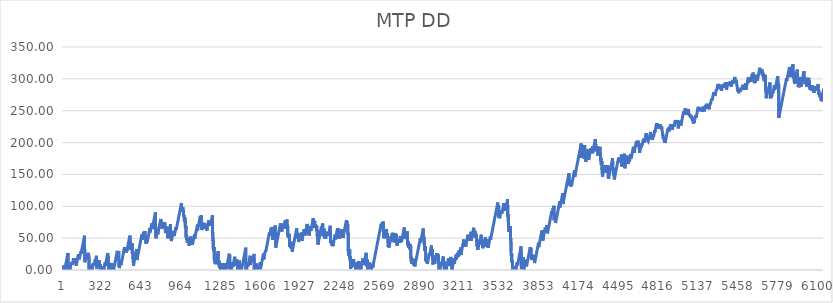
| Category | MTP DD |
|---|---|
| 0 | 1 |
| 1 | 2 |
| 2 | 3 |
| 3 | 4 |
| 4 | 5 |
| 5 | 6 |
| 6 | 7 |
| 7 | 8 |
| 8 | 1.41 |
| 9 | 2.42 |
| 10 | 3.43 |
| 11 | 4.44 |
| 12 | 5.45 |
| 13 | 0 |
| 14 | 1.05 |
| 15 | 2.1 |
| 16 | 3.1 |
| 17 | 4.1 |
| 18 | 5.1 |
| 19 | 6.1 |
| 20 | 7.1 |
| 21 | 8.1 |
| 22 | 9.1 |
| 23 | 10.1 |
| 24 | 11.1 |
| 25 | 12.1 |
| 26 | 13.1 |
| 27 | 14.1 |
| 28 | 15.1 |
| 29 | 16.1 |
| 30 | 17.1 |
| 31 | 18.1 |
| 32 | 19.1 |
| 33 | 20.1 |
| 34 | 21.1 |
| 35 | 22.1 |
| 36 | 23.224 |
| 37 | 24.348 |
| 38 | 25.472 |
| 39 | 26.596 |
| 40 | 0 |
| 41 | 1 |
| 42 | 2 |
| 43 | 3 |
| 44 | 4 |
| 45 | 5 |
| 46 | 6.03 |
| 47 | 0 |
| 48 | 1.03 |
| 49 | 2.06 |
| 50 | 3.117 |
| 51 | 4.175 |
| 52 | 0 |
| 53 | 1.058 |
| 54 | 2.092 |
| 55 | 0 |
| 56 | 1.034 |
| 57 | 2.068 |
| 58 | 3.102 |
| 59 | 4.102 |
| 60 | 5.102 |
| 61 | 6.102 |
| 62 | 7.102 |
| 63 | 8.102 |
| 64 | 9.102 |
| 65 | 10.102 |
| 66 | 11.102 |
| 67 | 12.102 |
| 68 | 13.102 |
| 69 | 8.519 |
| 70 | 9.535 |
| 71 | 10.552 |
| 72 | 11.552 |
| 73 | 12.552 |
| 74 | 13.552 |
| 75 | 8.562 |
| 76 | 9.572 |
| 77 | 10.582 |
| 78 | 11.592 |
| 79 | 12.592 |
| 80 | 13.592 |
| 81 | 14.592 |
| 82 | 15.592 |
| 83 | 16.592 |
| 84 | 17.592 |
| 85 | 18.592 |
| 86 | 19.592 |
| 87 | 12.214 |
| 88 | 13.237 |
| 89 | 14.26 |
| 90 | 15.282 |
| 91 | 10.59 |
| 92 | 11.597 |
| 93 | 12.604 |
| 94 | 13.612 |
| 95 | 14.612 |
| 96 | 15.612 |
| 97 | 16.612 |
| 98 | 17.612 |
| 99 | 18.612 |
| 100 | 13.722 |
| 101 | 14.732 |
| 102 | 15.742 |
| 103 | 16.752 |
| 104 | 17.784 |
| 105 | 18.816 |
| 106 | 6.848 |
| 107 | 7.88 |
| 108 | 8.912 |
| 109 | 9.912 |
| 110 | 10.912 |
| 111 | 11.912 |
| 112 | 12.912 |
| 113 | 13.912 |
| 114 | 14.912 |
| 115 | 15.912 |
| 116 | 16.912 |
| 117 | 17.912 |
| 118 | 18.912 |
| 119 | 19.912 |
| 120 | 20.912 |
| 121 | 21.912 |
| 122 | 22.912 |
| 123 | 23.912 |
| 124 | 24.912 |
| 125 | 19.716 |
| 126 | 20.72 |
| 127 | 21.724 |
| 128 | 22.728 |
| 129 | 23.732 |
| 130 | 24.748 |
| 131 | 16.764 |
| 132 | 17.78 |
| 133 | 18.796 |
| 134 | 19.812 |
| 135 | 20.812 |
| 136 | 21.812 |
| 137 | 22.812 |
| 138 | 23.812 |
| 139 | 24.812 |
| 140 | 25.812 |
| 141 | 26.812 |
| 142 | 27.812 |
| 143 | 28.812 |
| 144 | 29.812 |
| 145 | 25.429 |
| 146 | 26.445 |
| 147 | 27.462 |
| 148 | 28.462 |
| 149 | 29.462 |
| 150 | 30.462 |
| 151 | 31.462 |
| 152 | 32.462 |
| 153 | 33.462 |
| 154 | 34.462 |
| 155 | 35.462 |
| 156 | 36.462 |
| 157 | 37.462 |
| 158 | 38.462 |
| 159 | 39.462 |
| 160 | 40.462 |
| 161 | 41.462 |
| 162 | 42.462 |
| 163 | 43.462 |
| 164 | 44.462 |
| 165 | 45.462 |
| 166 | 46.462 |
| 167 | 47.462 |
| 168 | 48.462 |
| 169 | 49.462 |
| 170 | 50.462 |
| 171 | 51.462 |
| 172 | 52.662 |
| 173 | 53.862 |
| 174 | 55.062 |
| 175 | 12.262 |
| 176 | 13.262 |
| 177 | 14.262 |
| 178 | 15.262 |
| 179 | 16.262 |
| 180 | 17.262 |
| 181 | 18.262 |
| 182 | 19.262 |
| 183 | 20.262 |
| 184 | 21.262 |
| 185 | 22.262 |
| 186 | 23.262 |
| 187 | 24.262 |
| 188 | 16.876 |
| 189 | 17.89 |
| 190 | 18.904 |
| 191 | 19.918 |
| 192 | 20.932 |
| 193 | 21.932 |
| 194 | 22.932 |
| 195 | 23.932 |
| 196 | 24.932 |
| 197 | 20.932 |
| 198 | 21.932 |
| 199 | 22.932 |
| 200 | 23.932 |
| 201 | 24.932 |
| 202 | 25.932 |
| 203 | 26.932 |
| 204 | 18.772 |
| 205 | 19.812 |
| 206 | 20.852 |
| 207 | 21.957 |
| 208 | 23.062 |
| 209 | 24.167 |
| 210 | 0.272 |
| 211 | 1.287 |
| 212 | 0 |
| 213 | 1.015 |
| 214 | 2.03 |
| 215 | 3.03 |
| 216 | 4.03 |
| 217 | 5.03 |
| 218 | 6.03 |
| 219 | 7.03 |
| 220 | 8.03 |
| 221 | 9.12 |
| 222 | 0 |
| 223 | 1.034 |
| 224 | 0 |
| 225 | 1.034 |
| 226 | 2.068 |
| 227 | 3.102 |
| 228 | 0 |
| 229 | 1.02 |
| 230 | 2.04 |
| 231 | 3.06 |
| 232 | 4.075 |
| 233 | 0 |
| 234 | 1.015 |
| 235 | 2.03 |
| 236 | 3.03 |
| 237 | 4.03 |
| 238 | 5.03 |
| 239 | 6.03 |
| 240 | 7.03 |
| 241 | 8.03 |
| 242 | 9.03 |
| 243 | 10.03 |
| 244 | 7.1 |
| 245 | 8.12 |
| 246 | 9.12 |
| 247 | 10.12 |
| 248 | 11.12 |
| 249 | 12.12 |
| 250 | 6.726 |
| 251 | 7.732 |
| 252 | 8.738 |
| 253 | 9.744 |
| 254 | 10.75 |
| 255 | 11.75 |
| 256 | 12.75 |
| 257 | 13.75 |
| 258 | 14.75 |
| 259 | 15.75 |
| 260 | 16.75 |
| 261 | 14.103 |
| 262 | 15.107 |
| 263 | 16.11 |
| 264 | 17.11 |
| 265 | 18.11 |
| 266 | 19.11 |
| 267 | 20.11 |
| 268 | 21.11 |
| 269 | 22.2 |
| 270 | 23.29 |
| 271 | 2.38 |
| 272 | 3.47 |
| 273 | 4.47 |
| 274 | 5.47 |
| 275 | 6.47 |
| 276 | 7.47 |
| 277 | 8.47 |
| 278 | 9.47 |
| 279 | 10.47 |
| 280 | 11.47 |
| 281 | 12.47 |
| 282 | 13.47 |
| 283 | 14.492 |
| 284 | 5.014 |
| 285 | 6.036 |
| 286 | 7.058 |
| 287 | 8.08 |
| 288 | 9.08 |
| 289 | 10.08 |
| 290 | 11.08 |
| 291 | 12.08 |
| 292 | 13.08 |
| 293 | 14.104 |
| 294 | 15.128 |
| 295 | 5.152 |
| 296 | 6.176 |
| 297 | 7.2 |
| 298 | 8.28 |
| 299 | 9.36 |
| 300 | 10.44 |
| 301 | 0 |
| 302 | 1.08 |
| 303 | 2.08 |
| 304 | 3.08 |
| 305 | 0 |
| 306 | 1.012 |
| 307 | 2.024 |
| 308 | 3.036 |
| 309 | 4.048 |
| 310 | 5.228 |
| 311 | 6.408 |
| 312 | 0 |
| 313 | 0 |
| 314 | 1.008 |
| 315 | 2.016 |
| 316 | 3.024 |
| 317 | 4.032 |
| 318 | 0 |
| 319 | 1.015 |
| 320 | 2.03 |
| 321 | 3.045 |
| 322 | 4.205 |
| 323 | 0 |
| 324 | 1.16 |
| 325 | 2.245 |
| 326 | 3.33 |
| 327 | 4.415 |
| 328 | 0 |
| 329 | 1 |
| 330 | 2 |
| 331 | 3 |
| 332 | 4 |
| 333 | 5 |
| 334 | 6 |
| 335 | 7 |
| 336 | 8 |
| 337 | 9 |
| 338 | 10 |
| 339 | 11 |
| 340 | 12 |
| 341 | 6.623 |
| 342 | 7.647 |
| 343 | 8.67 |
| 344 | 9.67 |
| 345 | 10.67 |
| 346 | 11.67 |
| 347 | 12.67 |
| 348 | 13.67 |
| 349 | 14.67 |
| 350 | 15.67 |
| 351 | 16.67 |
| 352 | 17.67 |
| 353 | 18.67 |
| 354 | 19.67 |
| 355 | 20.67 |
| 356 | 21.67 |
| 357 | 22.67 |
| 358 | 23.67 |
| 359 | 24.67 |
| 360 | 25.67 |
| 361 | 26.67 |
| 362 | 17.717 |
| 363 | 18.763 |
| 364 | 19.81 |
| 365 | 20.99 |
| 366 | 22.17 |
| 367 | 23.35 |
| 368 | 0 |
| 369 | 1.042 |
| 370 | 2.084 |
| 371 | 3.126 |
| 372 | 0 |
| 373 | 1.042 |
| 374 | 2.054 |
| 375 | 0 |
| 376 | 1.012 |
| 377 | 2.024 |
| 378 | 3.036 |
| 379 | 4.036 |
| 380 | 5.036 |
| 381 | 6.036 |
| 382 | 7.036 |
| 383 | 8.04 |
| 384 | 3.044 |
| 385 | 4.048 |
| 386 | 5.052 |
| 387 | 6.056 |
| 388 | 7.056 |
| 389 | 8.056 |
| 390 | 9.056 |
| 391 | 10.056 |
| 392 | 11.056 |
| 393 | 12.126 |
| 394 | 3.996 |
| 395 | 4.996 |
| 396 | 5.996 |
| 397 | 6.996 |
| 398 | 7.996 |
| 399 | 9.022 |
| 400 | 0 |
| 401 | 1.026 |
| 402 | 2.052 |
| 403 | 3.078 |
| 404 | 4.146 |
| 405 | 5.213 |
| 406 | 0 |
| 407 | 1.067 |
| 408 | 0 |
| 409 | 1.013 |
| 410 | 2.027 |
| 411 | 3.027 |
| 412 | 4.027 |
| 413 | 5.027 |
| 414 | 6.027 |
| 415 | 7.027 |
| 416 | 8.027 |
| 417 | 9.027 |
| 418 | 10.027 |
| 419 | 11.027 |
| 420 | 12.027 |
| 421 | 13.027 |
| 422 | 14.027 |
| 423 | 15.027 |
| 424 | 16.027 |
| 425 | 17.027 |
| 426 | 18.027 |
| 427 | 19.027 |
| 428 | 20.027 |
| 429 | 21.027 |
| 430 | 22.027 |
| 431 | 23.027 |
| 432 | 24.027 |
| 433 | 25.027 |
| 434 | 26.027 |
| 435 | 27.027 |
| 436 | 28.027 |
| 437 | 29.027 |
| 438 | 30.027 |
| 439 | 19.055 |
| 440 | 20.083 |
| 441 | 21.111 |
| 442 | 22.139 |
| 443 | 23.167 |
| 444 | 24.167 |
| 445 | 25.167 |
| 446 | 26.167 |
| 447 | 27.251 |
| 448 | 28.335 |
| 449 | 29.419 |
| 450 | 30.503 |
| 451 | 5.587 |
| 452 | 6.587 |
| 453 | 7.587 |
| 454 | 8.587 |
| 455 | 2.999 |
| 456 | 4.012 |
| 457 | 5.024 |
| 458 | 6.037 |
| 459 | 7.037 |
| 460 | 8.037 |
| 461 | 9.037 |
| 462 | 10.037 |
| 463 | 11.037 |
| 464 | 12.037 |
| 465 | 13.037 |
| 466 | 14.037 |
| 467 | 15.097 |
| 468 | 7.957 |
| 469 | 8.957 |
| 470 | 9.957 |
| 471 | 10.957 |
| 472 | 11.957 |
| 473 | 12.957 |
| 474 | 13.957 |
| 475 | 14.957 |
| 476 | 15.957 |
| 477 | 16.957 |
| 478 | 17.957 |
| 479 | 18.957 |
| 480 | 19.957 |
| 481 | 20.957 |
| 482 | 21.957 |
| 483 | 22.957 |
| 484 | 23.957 |
| 485 | 24.957 |
| 486 | 25.957 |
| 487 | 26.957 |
| 488 | 27.957 |
| 489 | 28.957 |
| 490 | 29.957 |
| 491 | 30.957 |
| 492 | 31.957 |
| 493 | 32.957 |
| 494 | 33.957 |
| 495 | 34.957 |
| 496 | 35.977 |
| 497 | 26.997 |
| 498 | 28.017 |
| 499 | 29.037 |
| 500 | 30.057 |
| 501 | 31.057 |
| 502 | 32.057 |
| 503 | 33.057 |
| 504 | 34.057 |
| 505 | 35.057 |
| 506 | 36.057 |
| 507 | 27.087 |
| 508 | 28.117 |
| 509 | 29.147 |
| 510 | 30.177 |
| 511 | 31.177 |
| 512 | 32.177 |
| 513 | 33.177 |
| 514 | 34.184 |
| 515 | 29.892 |
| 516 | 30.899 |
| 517 | 31.907 |
| 518 | 32.907 |
| 519 | 33.907 |
| 520 | 34.907 |
| 521 | 35.907 |
| 522 | 36.907 |
| 523 | 37.907 |
| 524 | 38.907 |
| 525 | 39.907 |
| 526 | 40.907 |
| 527 | 41.907 |
| 528 | 42.907 |
| 529 | 43.907 |
| 530 | 44.907 |
| 531 | 45.907 |
| 532 | 46.907 |
| 533 | 47.907 |
| 534 | 48.907 |
| 535 | 49.907 |
| 536 | 50.907 |
| 537 | 51.907 |
| 538 | 52.907 |
| 539 | 53.952 |
| 540 | 54.997 |
| 541 | 43.042 |
| 542 | 44.087 |
| 543 | 45.163 |
| 544 | 31.74 |
| 545 | 32.817 |
| 546 | 33.817 |
| 547 | 34.817 |
| 548 | 35.817 |
| 549 | 36.817 |
| 550 | 37.817 |
| 551 | 38.817 |
| 552 | 35.817 |
| 553 | 36.817 |
| 554 | 37.817 |
| 555 | 38.817 |
| 556 | 39.817 |
| 557 | 40.867 |
| 558 | 41.917 |
| 559 | 25.467 |
| 560 | 26.517 |
| 561 | 27.567 |
| 562 | 28.597 |
| 563 | 29.627 |
| 564 | 18.157 |
| 565 | 19.187 |
| 566 | 20.217 |
| 567 | 21.259 |
| 568 | 6.801 |
| 569 | 7.843 |
| 570 | 8.885 |
| 571 | 9.927 |
| 572 | 10.927 |
| 573 | 11.927 |
| 574 | 12.927 |
| 575 | 13.927 |
| 576 | 14.927 |
| 577 | 15.927 |
| 578 | 16.927 |
| 579 | 17.927 |
| 580 | 18.927 |
| 581 | 19.927 |
| 582 | 20.927 |
| 583 | 21.927 |
| 584 | 22.927 |
| 585 | 23.927 |
| 586 | 24.927 |
| 587 | 25.927 |
| 588 | 26.927 |
| 589 | 27.927 |
| 590 | 28.927 |
| 591 | 29.927 |
| 592 | 30.927 |
| 593 | 31.927 |
| 594 | 33.004 |
| 595 | 34.082 |
| 596 | 15.659 |
| 597 | 16.737 |
| 598 | 17.737 |
| 599 | 18.737 |
| 600 | 19.737 |
| 601 | 20.737 |
| 602 | 21.737 |
| 603 | 22.737 |
| 604 | 23.737 |
| 605 | 24.737 |
| 606 | 25.737 |
| 607 | 26.737 |
| 608 | 27.737 |
| 609 | 28.737 |
| 610 | 29.737 |
| 611 | 30.737 |
| 612 | 31.737 |
| 613 | 32.737 |
| 614 | 33.737 |
| 615 | 34.737 |
| 616 | 35.737 |
| 617 | 36.737 |
| 618 | 37.737 |
| 619 | 38.737 |
| 620 | 39.737 |
| 621 | 40.737 |
| 622 | 41.737 |
| 623 | 42.737 |
| 624 | 43.737 |
| 625 | 44.737 |
| 626 | 45.737 |
| 627 | 46.737 |
| 628 | 47.737 |
| 629 | 48.737 |
| 630 | 49.737 |
| 631 | 50.737 |
| 632 | 51.737 |
| 633 | 52.737 |
| 634 | 53.737 |
| 635 | 54.737 |
| 636 | 55.737 |
| 637 | 56.767 |
| 638 | 47.797 |
| 639 | 48.827 |
| 640 | 49.857 |
| 641 | 50.857 |
| 642 | 51.857 |
| 643 | 52.857 |
| 644 | 53.857 |
| 645 | 54.857 |
| 646 | 55.857 |
| 647 | 56.857 |
| 648 | 57.857 |
| 649 | 58.857 |
| 650 | 59.882 |
| 651 | 60.907 |
| 652 | 53.132 |
| 653 | 54.157 |
| 654 | 55.157 |
| 655 | 56.157 |
| 656 | 57.157 |
| 657 | 58.157 |
| 658 | 59.157 |
| 659 | 60.179 |
| 660 | 61.201 |
| 661 | 51.723 |
| 662 | 52.745 |
| 663 | 53.767 |
| 664 | 51.132 |
| 665 | 52.147 |
| 666 | 53.177 |
| 667 | 44.207 |
| 668 | 45.237 |
| 669 | 46.267 |
| 670 | 41.277 |
| 671 | 42.287 |
| 672 | 43.297 |
| 673 | 44.307 |
| 674 | 45.307 |
| 675 | 46.307 |
| 676 | 47.307 |
| 677 | 48.307 |
| 678 | 49.307 |
| 679 | 43.919 |
| 680 | 44.932 |
| 681 | 45.944 |
| 682 | 46.957 |
| 683 | 47.957 |
| 684 | 48.957 |
| 685 | 49.957 |
| 686 | 50.957 |
| 687 | 51.957 |
| 688 | 52.957 |
| 689 | 53.957 |
| 690 | 54.957 |
| 691 | 55.957 |
| 692 | 56.957 |
| 693 | 57.957 |
| 694 | 58.957 |
| 695 | 59.957 |
| 696 | 60.957 |
| 697 | 61.957 |
| 698 | 62.957 |
| 699 | 63.957 |
| 700 | 64.957 |
| 701 | 65.957 |
| 702 | 66.997 |
| 703 | 59.237 |
| 704 | 60.277 |
| 705 | 61.277 |
| 706 | 62.277 |
| 707 | 63.277 |
| 708 | 64.277 |
| 709 | 65.277 |
| 710 | 66.277 |
| 711 | 67.277 |
| 712 | 68.277 |
| 713 | 69.277 |
| 714 | 70.277 |
| 715 | 71.277 |
| 716 | 72.277 |
| 717 | 73.301 |
| 718 | 74.325 |
| 719 | 64.349 |
| 720 | 65.373 |
| 721 | 66.397 |
| 722 | 67.397 |
| 723 | 68.397 |
| 724 | 69.397 |
| 725 | 70.397 |
| 726 | 71.397 |
| 727 | 72.397 |
| 728 | 73.397 |
| 729 | 74.397 |
| 730 | 75.397 |
| 731 | 76.397 |
| 732 | 77.397 |
| 733 | 78.397 |
| 734 | 79.397 |
| 735 | 80.397 |
| 736 | 81.397 |
| 737 | 82.397 |
| 738 | 83.397 |
| 739 | 84.397 |
| 740 | 85.397 |
| 741 | 86.397 |
| 742 | 87.397 |
| 743 | 88.397 |
| 744 | 89.397 |
| 745 | 90.647 |
| 746 | 64.897 |
| 747 | 66 |
| 748 | 67.103 |
| 749 | 49.707 |
| 750 | 50.707 |
| 751 | 51.707 |
| 752 | 52.707 |
| 753 | 53.707 |
| 754 | 54.707 |
| 755 | 55.707 |
| 756 | 56.707 |
| 757 | 57.707 |
| 758 | 58.707 |
| 759 | 59.707 |
| 760 | 60.707 |
| 761 | 61.707 |
| 762 | 62.707 |
| 763 | 63.721 |
| 764 | 56.135 |
| 765 | 57.149 |
| 766 | 58.163 |
| 767 | 59.177 |
| 768 | 60.177 |
| 769 | 61.177 |
| 770 | 62.177 |
| 771 | 63.177 |
| 772 | 64.177 |
| 773 | 65.177 |
| 774 | 66.177 |
| 775 | 67.177 |
| 776 | 68.177 |
| 777 | 69.177 |
| 778 | 70.177 |
| 779 | 71.177 |
| 780 | 72.177 |
| 781 | 73.177 |
| 782 | 74.177 |
| 783 | 75.177 |
| 784 | 76.177 |
| 785 | 77.177 |
| 786 | 78.177 |
| 787 | 79.177 |
| 788 | 80.177 |
| 789 | 81.177 |
| 790 | 72.993 |
| 791 | 74.009 |
| 792 | 75.025 |
| 793 | 76.041 |
| 794 | 77.057 |
| 795 | 78.093 |
| 796 | 65.129 |
| 797 | 66.165 |
| 798 | 67.201 |
| 799 | 68.237 |
| 800 | 69.237 |
| 801 | 70.237 |
| 802 | 71.237 |
| 803 | 72.237 |
| 804 | 73.237 |
| 805 | 74.253 |
| 806 | 75.269 |
| 807 | 67.085 |
| 808 | 68.101 |
| 809 | 69.117 |
| 810 | 70.117 |
| 811 | 71.117 |
| 812 | 72.117 |
| 813 | 73.117 |
| 814 | 74.117 |
| 815 | 75.117 |
| 816 | 76.117 |
| 817 | 70.523 |
| 818 | 71.529 |
| 819 | 72.535 |
| 820 | 73.541 |
| 821 | 74.547 |
| 822 | 65.793 |
| 823 | 66.84 |
| 824 | 67.887 |
| 825 | 61.103 |
| 826 | 62.119 |
| 827 | 63.135 |
| 828 | 64.151 |
| 829 | 57.959 |
| 830 | 58.967 |
| 831 | 59.975 |
| 832 | 60.983 |
| 833 | 61.991 |
| 834 | 62.991 |
| 835 | 63.991 |
| 836 | 64.991 |
| 837 | 65.991 |
| 838 | 67.021 |
| 839 | 68.051 |
| 840 | 69.081 |
| 841 | 57.611 |
| 842 | 58.641 |
| 843 | 59.669 |
| 844 | 60.697 |
| 845 | 49.725 |
| 846 | 50.753 |
| 847 | 51.781 |
| 848 | 52.781 |
| 849 | 53.781 |
| 850 | 54.781 |
| 851 | 55.781 |
| 852 | 56.781 |
| 853 | 57.781 |
| 854 | 58.781 |
| 855 | 59.781 |
| 856 | 60.781 |
| 857 | 61.781 |
| 858 | 62.781 |
| 859 | 63.781 |
| 860 | 64.781 |
| 861 | 65.781 |
| 862 | 66.781 |
| 863 | 67.781 |
| 864 | 68.827 |
| 865 | 69.873 |
| 866 | 70.919 |
| 867 | 71.965 |
| 868 | 56.511 |
| 869 | 57.526 |
| 870 | 51.341 |
| 871 | 52.356 |
| 872 | 53.371 |
| 873 | 54.391 |
| 874 | 45.411 |
| 875 | 46.431 |
| 876 | 47.451 |
| 877 | 48.471 |
| 878 | 49.471 |
| 879 | 50.471 |
| 880 | 51.471 |
| 881 | 52.471 |
| 882 | 53.471 |
| 883 | 54.471 |
| 884 | 55.471 |
| 885 | 56.471 |
| 886 | 57.471 |
| 887 | 58.471 |
| 888 | 59.471 |
| 889 | 60.471 |
| 890 | 61.471 |
| 891 | 62.471 |
| 892 | 53.491 |
| 893 | 54.511 |
| 894 | 55.531 |
| 895 | 56.551 |
| 896 | 57.571 |
| 897 | 53.376 |
| 898 | 54.381 |
| 899 | 55.386 |
| 900 | 56.391 |
| 901 | 57.391 |
| 902 | 58.391 |
| 903 | 59.391 |
| 904 | 60.391 |
| 905 | 61.391 |
| 906 | 62.391 |
| 907 | 63.391 |
| 908 | 64.391 |
| 909 | 65.391 |
| 910 | 66.391 |
| 911 | 67.391 |
| 912 | 68.391 |
| 913 | 63.201 |
| 914 | 64.211 |
| 915 | 65.221 |
| 916 | 66.231 |
| 917 | 67.231 |
| 918 | 68.231 |
| 919 | 69.231 |
| 920 | 70.231 |
| 921 | 71.231 |
| 922 | 72.231 |
| 923 | 73.231 |
| 924 | 74.231 |
| 925 | 75.231 |
| 926 | 76.231 |
| 927 | 77.231 |
| 928 | 78.231 |
| 929 | 79.231 |
| 930 | 80.231 |
| 931 | 81.231 |
| 932 | 82.231 |
| 933 | 83.231 |
| 934 | 84.231 |
| 935 | 85.231 |
| 936 | 86.231 |
| 937 | 87.231 |
| 938 | 88.231 |
| 939 | 89.231 |
| 940 | 90.231 |
| 941 | 91.231 |
| 942 | 92.231 |
| 943 | 93.231 |
| 944 | 94.231 |
| 945 | 95.231 |
| 946 | 96.231 |
| 947 | 97.231 |
| 948 | 98.231 |
| 949 | 99.231 |
| 950 | 100.231 |
| 951 | 101.231 |
| 952 | 102.231 |
| 953 | 103.231 |
| 954 | 104.231 |
| 955 | 105.273 |
| 956 | 91.815 |
| 957 | 92.857 |
| 958 | 93.899 |
| 959 | 94.899 |
| 960 | 95.899 |
| 961 | 96.899 |
| 962 | 97.899 |
| 963 | 94.199 |
| 964 | 95.199 |
| 965 | 96.199 |
| 966 | 97.199 |
| 967 | 98.199 |
| 968 | 99.215 |
| 969 | 91.431 |
| 970 | 92.447 |
| 971 | 93.463 |
| 972 | 94.479 |
| 973 | 84.035 |
| 974 | 85.092 |
| 975 | 86.149 |
| 976 | 87.199 |
| 977 | 81.449 |
| 978 | 76.061 |
| 979 | 77.074 |
| 980 | 78.086 |
| 981 | 79.099 |
| 982 | 80.135 |
| 983 | 81.171 |
| 984 | 82.207 |
| 985 | 83.243 |
| 986 | 70.279 |
| 987 | 65.383 |
| 988 | 66.387 |
| 989 | 67.391 |
| 990 | 68.395 |
| 991 | 69.399 |
| 992 | 70.471 |
| 993 | 50.543 |
| 994 | 51.615 |
| 995 | 52.615 |
| 996 | 53.615 |
| 997 | 54.615 |
| 998 | 47.237 |
| 999 | 48.26 |
| 1000 | 49.282 |
| 1001 | 50.305 |
| 1002 | 43.317 |
| 1003 | 44.329 |
| 1004 | 45.341 |
| 1005 | 46.353 |
| 1006 | 47.365 |
| 1007 | 48.365 |
| 1008 | 49.365 |
| 1009 | 50.365 |
| 1010 | 45.369 |
| 1011 | 46.373 |
| 1012 | 47.377 |
| 1013 | 48.381 |
| 1014 | 49.385 |
| 1015 | 50.417 |
| 1016 | 38.449 |
| 1017 | 39.481 |
| 1018 | 40.513 |
| 1019 | 41.545 |
| 1020 | 42.545 |
| 1021 | 43.545 |
| 1022 | 44.545 |
| 1023 | 45.545 |
| 1024 | 46.545 |
| 1025 | 47.545 |
| 1026 | 48.545 |
| 1027 | 49.545 |
| 1028 | 50.545 |
| 1029 | 51.577 |
| 1030 | 52.609 |
| 1031 | 40.641 |
| 1032 | 41.673 |
| 1033 | 42.705 |
| 1034 | 43.705 |
| 1035 | 44.705 |
| 1036 | 45.705 |
| 1037 | 46.705 |
| 1038 | 47.705 |
| 1039 | 42.311 |
| 1040 | 43.317 |
| 1041 | 44.323 |
| 1042 | 45.329 |
| 1043 | 46.335 |
| 1044 | 39.745 |
| 1045 | 40.755 |
| 1046 | 41.765 |
| 1047 | 42.775 |
| 1048 | 43.785 |
| 1049 | 44.785 |
| 1050 | 45.785 |
| 1051 | 46.785 |
| 1052 | 47.785 |
| 1053 | 48.785 |
| 1054 | 49.785 |
| 1055 | 50.785 |
| 1056 | 51.785 |
| 1057 | 52.785 |
| 1058 | 53.785 |
| 1059 | 54.785 |
| 1060 | 55.785 |
| 1061 | 56.801 |
| 1062 | 49.017 |
| 1063 | 50.033 |
| 1064 | 51.049 |
| 1065 | 52.065 |
| 1066 | 53.065 |
| 1067 | 54.065 |
| 1068 | 55.065 |
| 1069 | 56.065 |
| 1070 | 57.065 |
| 1071 | 58.065 |
| 1072 | 59.065 |
| 1073 | 60.065 |
| 1074 | 61.065 |
| 1075 | 62.065 |
| 1076 | 63.065 |
| 1077 | 64.065 |
| 1078 | 65.065 |
| 1079 | 66.065 |
| 1080 | 67.065 |
| 1081 | 68.065 |
| 1082 | 69.065 |
| 1083 | 70.065 |
| 1084 | 71.065 |
| 1085 | 62.085 |
| 1086 | 63.105 |
| 1087 | 64.125 |
| 1088 | 65.145 |
| 1089 | 66.165 |
| 1090 | 67.165 |
| 1091 | 68.165 |
| 1092 | 69.165 |
| 1093 | 70.165 |
| 1094 | 71.165 |
| 1095 | 72.165 |
| 1096 | 73.165 |
| 1097 | 74.165 |
| 1098 | 75.165 |
| 1099 | 76.165 |
| 1100 | 77.165 |
| 1101 | 78.165 |
| 1102 | 79.165 |
| 1103 | 80.165 |
| 1104 | 81.165 |
| 1105 | 82.165 |
| 1106 | 83.165 |
| 1107 | 84.165 |
| 1108 | 85.165 |
| 1109 | 79.777 |
| 1110 | 80.79 |
| 1111 | 81.802 |
| 1112 | 82.815 |
| 1113 | 83.815 |
| 1114 | 84.815 |
| 1115 | 85.882 |
| 1116 | 69.45 |
| 1117 | 70.517 |
| 1118 | 71.585 |
| 1119 | 62.631 |
| 1120 | 63.678 |
| 1121 | 64.725 |
| 1122 | 65.725 |
| 1123 | 66.725 |
| 1124 | 67.725 |
| 1125 | 68.725 |
| 1126 | 69.725 |
| 1127 | 70.725 |
| 1128 | 71.725 |
| 1129 | 66.137 |
| 1130 | 67.15 |
| 1131 | 68.162 |
| 1132 | 69.175 |
| 1133 | 70.175 |
| 1134 | 71.175 |
| 1135 | 72.175 |
| 1136 | 73.175 |
| 1137 | 74.175 |
| 1138 | 75.205 |
| 1139 | 64.735 |
| 1140 | 65.765 |
| 1141 | 66.795 |
| 1142 | 67.795 |
| 1143 | 68.795 |
| 1144 | 69.795 |
| 1145 | 70.795 |
| 1146 | 71.795 |
| 1147 | 72.828 |
| 1148 | 66.061 |
| 1149 | 67.095 |
| 1150 | 68.095 |
| 1151 | 69.095 |
| 1152 | 70.095 |
| 1153 | 71.095 |
| 1154 | 72.095 |
| 1155 | 73.109 |
| 1156 | 65.523 |
| 1157 | 66.537 |
| 1158 | 67.551 |
| 1159 | 68.565 |
| 1160 | 62.02 |
| 1161 | 63.075 |
| 1162 | 64.075 |
| 1163 | 65.075 |
| 1164 | 66.075 |
| 1165 | 67.075 |
| 1166 | 68.075 |
| 1167 | 69.075 |
| 1168 | 70.075 |
| 1169 | 71.075 |
| 1170 | 72.075 |
| 1171 | 73.075 |
| 1172 | 74.075 |
| 1173 | 75.075 |
| 1174 | 76.075 |
| 1175 | 77.075 |
| 1176 | 78.075 |
| 1177 | 79.097 |
| 1178 | 69.619 |
| 1179 | 70.641 |
| 1180 | 71.663 |
| 1181 | 72.685 |
| 1182 | 73.685 |
| 1183 | 74.685 |
| 1184 | 75.685 |
| 1185 | 70.489 |
| 1186 | 71.493 |
| 1187 | 72.497 |
| 1188 | 73.501 |
| 1189 | 74.505 |
| 1190 | 75.505 |
| 1191 | 76.505 |
| 1192 | 77.505 |
| 1193 | 73.71 |
| 1194 | 74.715 |
| 1195 | 75.72 |
| 1196 | 76.725 |
| 1197 | 77.725 |
| 1198 | 78.725 |
| 1199 | 79.725 |
| 1200 | 80.725 |
| 1201 | 81.725 |
| 1202 | 82.825 |
| 1203 | 83.925 |
| 1204 | 85.025 |
| 1205 | 86.125 |
| 1206 | 57.225 |
| 1207 | 58.265 |
| 1208 | 59.305 |
| 1209 | 45.345 |
| 1210 | 46.385 |
| 1211 | 47.425 |
| 1212 | 48.505 |
| 1213 | 29.585 |
| 1214 | 30.665 |
| 1215 | 31.745 |
| 1216 | 32.803 |
| 1217 | 33.861 |
| 1218 | 34.919 |
| 1219 | 35.977 |
| 1220 | 17.535 |
| 1221 | 18.543 |
| 1222 | 12.551 |
| 1223 | 13.559 |
| 1224 | 14.567 |
| 1225 | 15.575 |
| 1226 | 10.379 |
| 1227 | 11.383 |
| 1228 | 12.387 |
| 1229 | 13.391 |
| 1230 | 14.395 |
| 1231 | 9.199 |
| 1232 | 10.203 |
| 1233 | 11.207 |
| 1234 | 12.211 |
| 1235 | 13.215 |
| 1236 | 14.215 |
| 1237 | 15.215 |
| 1238 | 16.215 |
| 1239 | 17.215 |
| 1240 | 18.215 |
| 1241 | 19.215 |
| 1242 | 20.215 |
| 1243 | 21.215 |
| 1244 | 22.215 |
| 1245 | 23.215 |
| 1246 | 24.215 |
| 1247 | 25.215 |
| 1248 | 26.215 |
| 1249 | 27.287 |
| 1250 | 28.359 |
| 1251 | 29.431 |
| 1252 | 30.503 |
| 1253 | 8.575 |
| 1254 | 9.575 |
| 1255 | 10.575 |
| 1256 | 11.575 |
| 1257 | 12.575 |
| 1258 | 13.575 |
| 1259 | 14.603 |
| 1260 | 15.631 |
| 1261 | 4.659 |
| 1262 | 5.687 |
| 1263 | 6.715 |
| 1264 | 2.815 |
| 1265 | 3.815 |
| 1266 | 4.815 |
| 1267 | 5.815 |
| 1268 | 6.815 |
| 1269 | 7.851 |
| 1270 | 0 |
| 1271 | 1.036 |
| 1272 | 2.072 |
| 1273 | 3.108 |
| 1274 | 4.108 |
| 1275 | 5.108 |
| 1276 | 6.108 |
| 1277 | 7.108 |
| 1278 | 8.108 |
| 1279 | 9.298 |
| 1280 | 10.488 |
| 1281 | 11.678 |
| 1282 | 0 |
| 1283 | 1.125 |
| 1284 | 2.25 |
| 1285 | 0 |
| 1286 | 1.125 |
| 1287 | 2.125 |
| 1288 | 3.125 |
| 1289 | 4.125 |
| 1290 | 5.125 |
| 1291 | 6.125 |
| 1292 | 7.181 |
| 1293 | 8.237 |
| 1294 | 9.293 |
| 1295 | 0 |
| 1296 | 1.056 |
| 1297 | 2.056 |
| 1298 | 3.056 |
| 1299 | 4.056 |
| 1300 | 5.056 |
| 1301 | 6.056 |
| 1302 | 7.156 |
| 1303 | 8.256 |
| 1304 | 9.356 |
| 1305 | 10.456 |
| 1306 | 0 |
| 1307 | 1 |
| 1308 | 2 |
| 1309 | 3 |
| 1310 | 4 |
| 1311 | 5 |
| 1312 | 6 |
| 1313 | 7 |
| 1314 | 8 |
| 1315 | 9.027 |
| 1316 | 10.055 |
| 1317 | 1.482 |
| 1318 | 2.51 |
| 1319 | 3.51 |
| 1320 | 4.51 |
| 1321 | 5.51 |
| 1322 | 6.51 |
| 1323 | 7.51 |
| 1324 | 8.51 |
| 1325 | 9.51 |
| 1326 | 10.51 |
| 1327 | 11.51 |
| 1328 | 12.51 |
| 1329 | 13.51 |
| 1330 | 14.51 |
| 1331 | 15.51 |
| 1332 | 16.51 |
| 1333 | 17.51 |
| 1334 | 18.51 |
| 1335 | 19.51 |
| 1336 | 20.51 |
| 1337 | 21.51 |
| 1338 | 22.51 |
| 1339 | 23.51 |
| 1340 | 24.51 |
| 1341 | 25.51 |
| 1342 | 21.92 |
| 1343 | 22.93 |
| 1344 | 23.94 |
| 1345 | 25.17 |
| 1346 | 1.4 |
| 1347 | 2.436 |
| 1348 | 3.472 |
| 1349 | 0 |
| 1350 | 1.036 |
| 1351 | 2.072 |
| 1352 | 3.122 |
| 1353 | 4.172 |
| 1354 | 0 |
| 1355 | 1.05 |
| 1356 | 0 |
| 1357 | 1 |
| 1358 | 2 |
| 1359 | 3 |
| 1360 | 4 |
| 1361 | 5 |
| 1362 | 6 |
| 1363 | 7 |
| 1364 | 8 |
| 1365 | 9 |
| 1366 | 10 |
| 1367 | 11 |
| 1368 | 12.014 |
| 1369 | 4.628 |
| 1370 | 5.642 |
| 1371 | 6.656 |
| 1372 | 7.67 |
| 1373 | 8.67 |
| 1374 | 9.67 |
| 1375 | 10.67 |
| 1376 | 11.67 |
| 1377 | 12.67 |
| 1378 | 13.67 |
| 1379 | 14.67 |
| 1380 | 15.67 |
| 1381 | 16.67 |
| 1382 | 17.67 |
| 1383 | 18.71 |
| 1384 | 19.75 |
| 1385 | 20.79 |
| 1386 | 6.83 |
| 1387 | 7.87 |
| 1388 | 8.87 |
| 1389 | 9.87 |
| 1390 | 10.87 |
| 1391 | 11.87 |
| 1392 | 12.87 |
| 1393 | 13.87 |
| 1394 | 14.87 |
| 1395 | 15.87 |
| 1396 | 16.87 |
| 1397 | 13.777 |
| 1398 | 14.783 |
| 1399 | 15.79 |
| 1400 | 9.998 |
| 1401 | 11.006 |
| 1402 | 12.014 |
| 1403 | 13.022 |
| 1404 | 14.03 |
| 1405 | 15.074 |
| 1406 | 16.118 |
| 1407 | 1.162 |
| 1408 | 2.206 |
| 1409 | 3.25 |
| 1410 | 0.307 |
| 1411 | 1.313 |
| 1412 | 2.32 |
| 1413 | 3.32 |
| 1414 | 4.32 |
| 1415 | 5.32 |
| 1416 | 6.32 |
| 1417 | 7.32 |
| 1418 | 8.32 |
| 1419 | 9.32 |
| 1420 | 10.32 |
| 1421 | 11.42 |
| 1422 | 12.52 |
| 1423 | 13.62 |
| 1424 | 14.72 |
| 1425 | 0 |
| 1426 | 1.1 |
| 1427 | 2.2 |
| 1428 | 3.3 |
| 1429 | 0 |
| 1430 | 1.1 |
| 1431 | 0 |
| 1432 | 1.027 |
| 1433 | 2.055 |
| 1434 | 3.082 |
| 1435 | 4.172 |
| 1436 | 0 |
| 1437 | 1 |
| 1438 | 2 |
| 1439 | 3 |
| 1440 | 0.503 |
| 1441 | 1.507 |
| 1442 | 2.51 |
| 1443 | 3.51 |
| 1444 | 4.51 |
| 1445 | 5.51 |
| 1446 | 6.51 |
| 1447 | 7.51 |
| 1448 | 8.51 |
| 1449 | 9.51 |
| 1450 | 10.51 |
| 1451 | 11.51 |
| 1452 | 12.51 |
| 1453 | 13.51 |
| 1454 | 14.51 |
| 1455 | 15.51 |
| 1456 | 16.51 |
| 1457 | 17.51 |
| 1458 | 18.51 |
| 1459 | 19.51 |
| 1460 | 20.51 |
| 1461 | 21.51 |
| 1462 | 22.51 |
| 1463 | 23.51 |
| 1464 | 24.51 |
| 1465 | 25.51 |
| 1466 | 26.51 |
| 1467 | 27.51 |
| 1468 | 28.51 |
| 1469 | 29.51 |
| 1470 | 30.51 |
| 1471 | 31.51 |
| 1472 | 32.51 |
| 1473 | 33.81 |
| 1474 | 35.11 |
| 1475 | 0 |
| 1476 | 1 |
| 1477 | 2 |
| 1478 | 3 |
| 1479 | 4 |
| 1480 | 0 |
| 1481 | 1.008 |
| 1482 | 2.016 |
| 1483 | 3.024 |
| 1484 | 4.032 |
| 1485 | 5.032 |
| 1486 | 6.032 |
| 1487 | 7.032 |
| 1488 | 8.032 |
| 1489 | 9.032 |
| 1490 | 10.032 |
| 1491 | 11.032 |
| 1492 | 12.032 |
| 1493 | 13.032 |
| 1494 | 6.244 |
| 1495 | 7.256 |
| 1496 | 8.268 |
| 1497 | 9.28 |
| 1498 | 10.292 |
| 1499 | 11.292 |
| 1500 | 12.292 |
| 1501 | 13.292 |
| 1502 | 14.292 |
| 1503 | 15.292 |
| 1504 | 16.292 |
| 1505 | 17.292 |
| 1506 | 18.292 |
| 1507 | 19.292 |
| 1508 | 20.292 |
| 1509 | 21.292 |
| 1510 | 22.338 |
| 1511 | 23.384 |
| 1512 | 7.93 |
| 1513 | 8.976 |
| 1514 | 10.022 |
| 1515 | 11.022 |
| 1516 | 12.022 |
| 1517 | 13.022 |
| 1518 | 14.022 |
| 1519 | 15.022 |
| 1520 | 16.022 |
| 1521 | 17.022 |
| 1522 | 18.022 |
| 1523 | 19.022 |
| 1524 | 20.034 |
| 1525 | 13.046 |
| 1526 | 14.058 |
| 1527 | 15.07 |
| 1528 | 16.082 |
| 1529 | 12.889 |
| 1530 | 13.895 |
| 1531 | 14.902 |
| 1532 | 15.902 |
| 1533 | 16.902 |
| 1534 | 17.902 |
| 1535 | 18.902 |
| 1536 | 19.902 |
| 1537 | 20.902 |
| 1538 | 21.902 |
| 1539 | 23.032 |
| 1540 | 24.162 |
| 1541 | 25.292 |
| 1542 | 0 |
| 1543 | 1 |
| 1544 | 2 |
| 1545 | 3 |
| 1546 | 4 |
| 1547 | 5 |
| 1548 | 6.173 |
| 1549 | 7.347 |
| 1550 | 0 |
| 1551 | 1 |
| 1552 | 2 |
| 1553 | 3 |
| 1554 | 4 |
| 1555 | 5 |
| 1556 | 6 |
| 1557 | 7 |
| 1558 | 8.08 |
| 1559 | 9.16 |
| 1560 | 10.24 |
| 1561 | 0 |
| 1562 | 1 |
| 1563 | 2 |
| 1564 | 3 |
| 1565 | 4 |
| 1566 | 5.145 |
| 1567 | 0 |
| 1568 | 1 |
| 1569 | 2 |
| 1570 | 3 |
| 1571 | 4 |
| 1572 | 5 |
| 1573 | 0.408 |
| 1574 | 1.415 |
| 1575 | 2.423 |
| 1576 | 3.43 |
| 1577 | 4.494 |
| 1578 | 5.558 |
| 1579 | 0 |
| 1580 | 1.064 |
| 1581 | 2.128 |
| 1582 | 3.128 |
| 1583 | 4.128 |
| 1584 | 5.128 |
| 1585 | 6.128 |
| 1586 | 7.128 |
| 1587 | 8.128 |
| 1588 | 9.128 |
| 1589 | 10.128 |
| 1590 | 11.128 |
| 1591 | 12.128 |
| 1592 | 13.158 |
| 1593 | 1.688 |
| 1594 | 2.718 |
| 1595 | 3.748 |
| 1596 | 4.778 |
| 1597 | 5.778 |
| 1598 | 6.778 |
| 1599 | 7.778 |
| 1600 | 8.778 |
| 1601 | 9.778 |
| 1602 | 10.778 |
| 1603 | 11.778 |
| 1604 | 12.778 |
| 1605 | 13.778 |
| 1606 | 14.778 |
| 1607 | 15.778 |
| 1608 | 16.778 |
| 1609 | 17.778 |
| 1610 | 18.778 |
| 1611 | 19.778 |
| 1612 | 20.778 |
| 1613 | 21.778 |
| 1614 | 22.778 |
| 1615 | 23.778 |
| 1616 | 24.778 |
| 1617 | 25.802 |
| 1618 | 26.826 |
| 1619 | 16.85 |
| 1620 | 17.874 |
| 1621 | 18.898 |
| 1622 | 19.898 |
| 1623 | 20.898 |
| 1624 | 21.898 |
| 1625 | 22.898 |
| 1626 | 23.898 |
| 1627 | 24.898 |
| 1628 | 25.898 |
| 1629 | 26.898 |
| 1630 | 27.898 |
| 1631 | 28.898 |
| 1632 | 29.898 |
| 1633 | 30.898 |
| 1634 | 31.898 |
| 1635 | 28.918 |
| 1636 | 29.938 |
| 1637 | 30.938 |
| 1638 | 31.938 |
| 1639 | 32.938 |
| 1640 | 33.938 |
| 1641 | 34.938 |
| 1642 | 35.938 |
| 1643 | 36.938 |
| 1644 | 37.938 |
| 1645 | 38.938 |
| 1646 | 39.938 |
| 1647 | 40.938 |
| 1648 | 41.938 |
| 1649 | 42.938 |
| 1650 | 43.938 |
| 1651 | 44.938 |
| 1652 | 45.938 |
| 1653 | 46.938 |
| 1654 | 47.938 |
| 1655 | 48.938 |
| 1656 | 49.938 |
| 1657 | 50.938 |
| 1658 | 51.938 |
| 1659 | 52.938 |
| 1660 | 53.938 |
| 1661 | 54.938 |
| 1662 | 55.938 |
| 1663 | 56.938 |
| 1664 | 57.938 |
| 1665 | 58.938 |
| 1666 | 59.938 |
| 1667 | 53.946 |
| 1668 | 54.954 |
| 1669 | 55.962 |
| 1670 | 56.97 |
| 1671 | 57.978 |
| 1672 | 58.978 |
| 1673 | 59.978 |
| 1674 | 60.978 |
| 1675 | 61.978 |
| 1676 | 62.978 |
| 1677 | 63.978 |
| 1678 | 64.978 |
| 1679 | 66.038 |
| 1680 | 59.298 |
| 1681 | 60.298 |
| 1682 | 61.298 |
| 1683 | 62.298 |
| 1684 | 63.298 |
| 1685 | 64.298 |
| 1686 | 65.362 |
| 1687 | 66.426 |
| 1688 | 67.49 |
| 1689 | 47.554 |
| 1690 | 48.618 |
| 1691 | 49.618 |
| 1692 | 50.618 |
| 1693 | 51.618 |
| 1694 | 52.618 |
| 1695 | 53.618 |
| 1696 | 54.618 |
| 1697 | 55.618 |
| 1698 | 56.618 |
| 1699 | 57.618 |
| 1700 | 58.618 |
| 1701 | 59.618 |
| 1702 | 60.618 |
| 1703 | 61.618 |
| 1704 | 62.618 |
| 1705 | 63.618 |
| 1706 | 64.618 |
| 1707 | 65.618 |
| 1708 | 66.618 |
| 1709 | 67.618 |
| 1710 | 68.65 |
| 1711 | 69.682 |
| 1712 | 57.714 |
| 1713 | 58.746 |
| 1714 | 59.778 |
| 1715 | 61.028 |
| 1716 | 35.278 |
| 1717 | 36.278 |
| 1718 | 37.278 |
| 1719 | 38.278 |
| 1720 | 39.278 |
| 1721 | 40.278 |
| 1722 | 41.278 |
| 1723 | 42.278 |
| 1724 | 43.278 |
| 1725 | 44.278 |
| 1726 | 45.278 |
| 1727 | 46.278 |
| 1728 | 47.278 |
| 1729 | 48.278 |
| 1730 | 49.278 |
| 1731 | 50.278 |
| 1732 | 51.278 |
| 1733 | 52.278 |
| 1734 | 53.278 |
| 1735 | 54.278 |
| 1736 | 55.278 |
| 1737 | 56.278 |
| 1738 | 57.278 |
| 1739 | 58.278 |
| 1740 | 59.278 |
| 1741 | 60.278 |
| 1742 | 61.278 |
| 1743 | 62.278 |
| 1744 | 63.278 |
| 1745 | 64.278 |
| 1746 | 65.278 |
| 1747 | 66.278 |
| 1748 | 67.278 |
| 1749 | 68.278 |
| 1750 | 69.278 |
| 1751 | 70.278 |
| 1752 | 71.278 |
| 1753 | 72.278 |
| 1754 | 73.278 |
| 1755 | 74.32 |
| 1756 | 62.863 |
| 1757 | 63.905 |
| 1758 | 64.948 |
| 1759 | 65.948 |
| 1760 | 66.948 |
| 1761 | 67.948 |
| 1762 | 68.948 |
| 1763 | 69.948 |
| 1764 | 60.47 |
| 1765 | 61.492 |
| 1766 | 62.514 |
| 1767 | 63.536 |
| 1768 | 64.558 |
| 1769 | 65.558 |
| 1770 | 66.558 |
| 1771 | 67.558 |
| 1772 | 68.558 |
| 1773 | 69.558 |
| 1774 | 70.558 |
| 1775 | 71.558 |
| 1776 | 72.558 |
| 1777 | 66.964 |
| 1778 | 67.97 |
| 1779 | 68.976 |
| 1780 | 69.982 |
| 1781 | 70.988 |
| 1782 | 67.49 |
| 1783 | 68.493 |
| 1784 | 69.495 |
| 1785 | 70.498 |
| 1786 | 71.498 |
| 1787 | 72.498 |
| 1788 | 73.498 |
| 1789 | 74.498 |
| 1790 | 75.498 |
| 1791 | 76.545 |
| 1792 | 77.593 |
| 1793 | 65.14 |
| 1794 | 66.188 |
| 1795 | 67.188 |
| 1796 | 68.188 |
| 1797 | 69.188 |
| 1798 | 70.188 |
| 1799 | 71.188 |
| 1800 | 72.188 |
| 1801 | 73.188 |
| 1802 | 74.188 |
| 1803 | 75.188 |
| 1804 | 76.188 |
| 1805 | 77.228 |
| 1806 | 78.268 |
| 1807 | 79.308 |
| 1808 | 65.348 |
| 1809 | 66.388 |
| 1810 | 67.448 |
| 1811 | 68.508 |
| 1812 | 69.568 |
| 1813 | 70.628 |
| 1814 | 51.688 |
| 1815 | 52.688 |
| 1816 | 53.688 |
| 1817 | 54.688 |
| 1818 | 55.688 |
| 1819 | 50.692 |
| 1820 | 51.696 |
| 1821 | 52.7 |
| 1822 | 53.704 |
| 1823 | 54.708 |
| 1824 | 55.78 |
| 1825 | 56.852 |
| 1826 | 57.924 |
| 1827 | 35.996 |
| 1828 | 37.068 |
| 1829 | 38.068 |
| 1830 | 39.068 |
| 1831 | 40.068 |
| 1832 | 41.068 |
| 1833 | 42.068 |
| 1834 | 34.284 |
| 1835 | 35.3 |
| 1836 | 36.316 |
| 1837 | 37.332 |
| 1838 | 38.348 |
| 1839 | 39.348 |
| 1840 | 40.348 |
| 1841 | 41.348 |
| 1842 | 42.348 |
| 1843 | 43.348 |
| 1844 | 44.374 |
| 1845 | 33.9 |
| 1846 | 34.926 |
| 1847 | 35.952 |
| 1848 | 36.978 |
| 1849 | 29.194 |
| 1850 | 30.21 |
| 1851 | 31.226 |
| 1852 | 32.242 |
| 1853 | 33.258 |
| 1854 | 34.258 |
| 1855 | 35.258 |
| 1856 | 36.258 |
| 1857 | 37.258 |
| 1858 | 38.258 |
| 1859 | 39.258 |
| 1860 | 40.258 |
| 1861 | 41.258 |
| 1862 | 42.258 |
| 1863 | 43.258 |
| 1864 | 44.258 |
| 1865 | 45.258 |
| 1866 | 46.258 |
| 1867 | 47.258 |
| 1868 | 48.258 |
| 1869 | 49.258 |
| 1870 | 50.258 |
| 1871 | 51.258 |
| 1872 | 52.258 |
| 1873 | 53.258 |
| 1874 | 54.258 |
| 1875 | 55.258 |
| 1876 | 56.258 |
| 1877 | 57.258 |
| 1878 | 58.258 |
| 1879 | 59.258 |
| 1880 | 60.258 |
| 1881 | 61.258 |
| 1882 | 62.258 |
| 1883 | 63.258 |
| 1884 | 64.302 |
| 1885 | 65.346 |
| 1886 | 50.39 |
| 1887 | 51.434 |
| 1888 | 52.478 |
| 1889 | 53.478 |
| 1890 | 54.478 |
| 1891 | 55.478 |
| 1892 | 56.478 |
| 1893 | 57.478 |
| 1894 | 58.504 |
| 1895 | 59.53 |
| 1896 | 49.056 |
| 1897 | 50.082 |
| 1898 | 51.108 |
| 1899 | 52.183 |
| 1900 | 43.858 |
| 1901 | 44.858 |
| 1902 | 45.858 |
| 1903 | 46.858 |
| 1904 | 47.858 |
| 1905 | 48.858 |
| 1906 | 49.858 |
| 1907 | 50.858 |
| 1908 | 51.858 |
| 1909 | 52.858 |
| 1910 | 47.264 |
| 1911 | 48.27 |
| 1912 | 49.276 |
| 1913 | 50.282 |
| 1914 | 51.288 |
| 1915 | 52.288 |
| 1916 | 53.288 |
| 1917 | 54.288 |
| 1918 | 55.288 |
| 1919 | 56.288 |
| 1920 | 57.288 |
| 1921 | 58.288 |
| 1922 | 54.798 |
| 1923 | 55.808 |
| 1924 | 56.818 |
| 1925 | 57.868 |
| 1926 | 58.918 |
| 1927 | 45.968 |
| 1928 | 47.018 |
| 1929 | 48.018 |
| 1930 | 49.018 |
| 1931 | 50.018 |
| 1932 | 51.018 |
| 1933 | 52.018 |
| 1934 | 53.018 |
| 1935 | 54.018 |
| 1936 | 55.018 |
| 1937 | 56.018 |
| 1938 | 57.018 |
| 1939 | 58.018 |
| 1940 | 59.018 |
| 1941 | 60.018 |
| 1942 | 61.018 |
| 1943 | 62.018 |
| 1944 | 63.018 |
| 1945 | 64.018 |
| 1946 | 65.018 |
| 1947 | 56.048 |
| 1948 | 57.078 |
| 1949 | 58.108 |
| 1950 | 59.138 |
| 1951 | 54.342 |
| 1952 | 55.346 |
| 1953 | 56.35 |
| 1954 | 57.354 |
| 1955 | 58.358 |
| 1956 | 59.358 |
| 1957 | 60.358 |
| 1958 | 61.358 |
| 1959 | 62.358 |
| 1960 | 63.358 |
| 1961 | 64.358 |
| 1962 | 65.358 |
| 1963 | 66.358 |
| 1964 | 67.358 |
| 1965 | 68.358 |
| 1966 | 69.358 |
| 1967 | 70.358 |
| 1968 | 71.358 |
| 1969 | 72.358 |
| 1970 | 73.455 |
| 1971 | 57.051 |
| 1972 | 58.148 |
| 1973 | 59.148 |
| 1974 | 60.148 |
| 1975 | 61.148 |
| 1976 | 62.148 |
| 1977 | 63.148 |
| 1978 | 64.148 |
| 1979 | 65.148 |
| 1980 | 66.148 |
| 1981 | 67.148 |
| 1982 | 68.192 |
| 1983 | 69.236 |
| 1984 | 54.28 |
| 1985 | 55.324 |
| 1986 | 56.368 |
| 1987 | 57.368 |
| 1988 | 58.368 |
| 1989 | 59.368 |
| 1990 | 60.368 |
| 1991 | 61.368 |
| 1992 | 62.368 |
| 1993 | 63.368 |
| 1994 | 64.368 |
| 1995 | 65.368 |
| 1996 | 66.368 |
| 1997 | 67.368 |
| 1998 | 68.368 |
| 1999 | 61.401 |
| 2000 | 62.435 |
| 2001 | 63.468 |
| 2002 | 64.468 |
| 2003 | 65.468 |
| 2004 | 66.468 |
| 2005 | 67.468 |
| 2006 | 68.468 |
| 2007 | 69.468 |
| 2008 | 70.468 |
| 2009 | 71.468 |
| 2010 | 72.468 |
| 2011 | 73.468 |
| 2012 | 74.468 |
| 2013 | 75.468 |
| 2014 | 76.468 |
| 2015 | 77.468 |
| 2016 | 78.468 |
| 2017 | 79.468 |
| 2018 | 80.51 |
| 2019 | 81.552 |
| 2020 | 67.094 |
| 2021 | 68.136 |
| 2022 | 69.178 |
| 2023 | 70.178 |
| 2024 | 71.178 |
| 2025 | 72.178 |
| 2026 | 73.178 |
| 2027 | 74.178 |
| 2028 | 75.178 |
| 2029 | 76.178 |
| 2030 | 77.178 |
| 2031 | 65.741 |
| 2032 | 66.805 |
| 2033 | 67.868 |
| 2034 | 68.868 |
| 2035 | 69.868 |
| 2036 | 70.868 |
| 2037 | 71.868 |
| 2038 | 72.868 |
| 2039 | 67.491 |
| 2040 | 68.515 |
| 2041 | 69.538 |
| 2042 | 65.438 |
| 2043 | 66.438 |
| 2044 | 67.438 |
| 2045 | 68.438 |
| 2046 | 69.438 |
| 2047 | 61.081 |
| 2048 | 62.125 |
| 2049 | 63.168 |
| 2050 | 64.231 |
| 2051 | 52.795 |
| 2052 | 53.858 |
| 2053 | 54.91 |
| 2054 | 55.962 |
| 2055 | 57.014 |
| 2056 | 40.066 |
| 2057 | 41.118 |
| 2058 | 42.118 |
| 2059 | 43.118 |
| 2060 | 44.118 |
| 2061 | 45.118 |
| 2062 | 46.118 |
| 2063 | 47.118 |
| 2064 | 48.118 |
| 2065 | 49.118 |
| 2066 | 50.118 |
| 2067 | 51.118 |
| 2068 | 52.118 |
| 2069 | 53.118 |
| 2070 | 54.118 |
| 2071 | 55.118 |
| 2072 | 56.118 |
| 2073 | 57.118 |
| 2074 | 58.118 |
| 2075 | 59.118 |
| 2076 | 60.118 |
| 2077 | 61.118 |
| 2078 | 62.118 |
| 2079 | 63.118 |
| 2080 | 64.118 |
| 2081 | 65.118 |
| 2082 | 66.118 |
| 2083 | 67.118 |
| 2084 | 68.118 |
| 2085 | 69.118 |
| 2086 | 64.82 |
| 2087 | 65.822 |
| 2088 | 66.824 |
| 2089 | 67.826 |
| 2090 | 68.828 |
| 2091 | 69.828 |
| 2092 | 70.828 |
| 2093 | 71.9 |
| 2094 | 72.973 |
| 2095 | 55.546 |
| 2096 | 56.618 |
| 2097 | 52.823 |
| 2098 | 53.828 |
| 2099 | 54.833 |
| 2100 | 55.838 |
| 2101 | 56.838 |
| 2102 | 57.838 |
| 2103 | 58.838 |
| 2104 | 59.838 |
| 2105 | 60.838 |
| 2106 | 61.838 |
| 2107 | 62.838 |
| 2108 | 63.838 |
| 2109 | 64.888 |
| 2110 | 65.938 |
| 2111 | 49.488 |
| 2112 | 50.538 |
| 2113 | 51.588 |
| 2114 | 52.588 |
| 2115 | 53.588 |
| 2116 | 54.588 |
| 2117 | 55.588 |
| 2118 | 49.006 |
| 2119 | 50.023 |
| 2120 | 51.04 |
| 2121 | 52.058 |
| 2122 | 53.058 |
| 2123 | 54.058 |
| 2124 | 55.058 |
| 2125 | 56.058 |
| 2126 | 57.058 |
| 2127 | 58.058 |
| 2128 | 59.058 |
| 2129 | 56.158 |
| 2130 | 57.158 |
| 2131 | 58.158 |
| 2132 | 59.158 |
| 2133 | 60.158 |
| 2134 | 53.768 |
| 2135 | 54.778 |
| 2136 | 55.788 |
| 2137 | 56.798 |
| 2138 | 57.808 |
| 2139 | 58.82 |
| 2140 | 53.233 |
| 2141 | 54.246 |
| 2142 | 55.258 |
| 2143 | 56.258 |
| 2144 | 57.258 |
| 2145 | 58.258 |
| 2146 | 59.258 |
| 2147 | 60.258 |
| 2148 | 61.258 |
| 2149 | 62.258 |
| 2150 | 63.258 |
| 2151 | 64.258 |
| 2152 | 65.258 |
| 2153 | 66.258 |
| 2154 | 67.258 |
| 2155 | 68.371 |
| 2156 | 69.485 |
| 2157 | 50.598 |
| 2158 | 42.216 |
| 2159 | 43.234 |
| 2160 | 44.252 |
| 2161 | 45.27 |
| 2162 | 46.288 |
| 2163 | 47.292 |
| 2164 | 42.096 |
| 2165 | 43.1 |
| 2166 | 44.104 |
| 2167 | 45.108 |
| 2168 | 46.124 |
| 2169 | 37.94 |
| 2170 | 38.956 |
| 2171 | 39.972 |
| 2172 | 40.988 |
| 2173 | 41.988 |
| 2174 | 42.988 |
| 2175 | 43.988 |
| 2176 | 44.988 |
| 2177 | 37.453 |
| 2178 | 38.518 |
| 2179 | 39.518 |
| 2180 | 40.518 |
| 2181 | 41.518 |
| 2182 | 42.518 |
| 2183 | 43.518 |
| 2184 | 44.518 |
| 2185 | 45.518 |
| 2186 | 46.518 |
| 2187 | 47.518 |
| 2188 | 48.518 |
| 2189 | 49.518 |
| 2190 | 50.518 |
| 2191 | 51.518 |
| 2192 | 52.518 |
| 2193 | 53.518 |
| 2194 | 54.518 |
| 2195 | 55.534 |
| 2196 | 47.35 |
| 2197 | 48.366 |
| 2198 | 49.382 |
| 2199 | 50.398 |
| 2200 | 51.398 |
| 2201 | 52.398 |
| 2202 | 53.398 |
| 2203 | 54.398 |
| 2204 | 55.398 |
| 2205 | 56.398 |
| 2206 | 57.398 |
| 2207 | 58.398 |
| 2208 | 59.398 |
| 2209 | 60.398 |
| 2210 | 61.398 |
| 2211 | 62.398 |
| 2212 | 63.398 |
| 2213 | 64.398 |
| 2214 | 65.398 |
| 2215 | 60.915 |
| 2216 | 61.931 |
| 2217 | 62.948 |
| 2218 | 63.99 |
| 2219 | 65.032 |
| 2220 | 50.574 |
| 2221 | 51.616 |
| 2222 | 52.658 |
| 2223 | 53.658 |
| 2224 | 54.658 |
| 2225 | 49.064 |
| 2226 | 50.07 |
| 2227 | 51.076 |
| 2228 | 52.082 |
| 2229 | 53.088 |
| 2230 | 54.088 |
| 2231 | 55.088 |
| 2232 | 56.088 |
| 2233 | 57.088 |
| 2234 | 58.088 |
| 2235 | 59.108 |
| 2236 | 50.328 |
| 2237 | 51.348 |
| 2238 | 52.368 |
| 2239 | 53.388 |
| 2240 | 54.388 |
| 2241 | 55.388 |
| 2242 | 56.388 |
| 2243 | 57.388 |
| 2244 | 58.388 |
| 2245 | 59.388 |
| 2246 | 60.388 |
| 2247 | 61.388 |
| 2248 | 62.388 |
| 2249 | 63.388 |
| 2250 | 64.404 |
| 2251 | 56.22 |
| 2252 | 57.236 |
| 2253 | 58.252 |
| 2254 | 59.268 |
| 2255 | 60.3 |
| 2256 | 61.332 |
| 2257 | 62.364 |
| 2258 | 50.396 |
| 2259 | 51.428 |
| 2260 | 52.428 |
| 2261 | 53.428 |
| 2262 | 54.428 |
| 2263 | 55.428 |
| 2264 | 56.428 |
| 2265 | 57.428 |
| 2266 | 58.428 |
| 2267 | 59.428 |
| 2268 | 60.428 |
| 2269 | 61.428 |
| 2270 | 62.428 |
| 2271 | 63.428 |
| 2272 | 64.428 |
| 2273 | 65.428 |
| 2274 | 66.428 |
| 2275 | 67.428 |
| 2276 | 68.428 |
| 2277 | 69.428 |
| 2278 | 70.428 |
| 2279 | 71.428 |
| 2280 | 72.428 |
| 2281 | 73.428 |
| 2282 | 74.428 |
| 2283 | 75.428 |
| 2284 | 76.428 |
| 2285 | 77.428 |
| 2286 | 78.44 |
| 2287 | 72.853 |
| 2288 | 73.865 |
| 2289 | 74.878 |
| 2290 | 75.898 |
| 2291 | 76.918 |
| 2292 | 67.938 |
| 2293 | 68.958 |
| 2294 | 69.978 |
| 2295 | 71.032 |
| 2296 | 72.086 |
| 2297 | 73.14 |
| 2298 | 55.694 |
| 2299 | 56.748 |
| 2300 | 57.981 |
| 2301 | 59.215 |
| 2302 | 22.448 |
| 2303 | 23.448 |
| 2304 | 24.448 |
| 2305 | 25.448 |
| 2306 | 26.448 |
| 2307 | 27.448 |
| 2308 | 28.448 |
| 2309 | 29.448 |
| 2310 | 30.492 |
| 2311 | 31.536 |
| 2312 | 32.58 |
| 2313 | 17.624 |
| 2314 | 18.668 |
| 2315 | 19.668 |
| 2316 | 20.668 |
| 2317 | 21.668 |
| 2318 | 22.795 |
| 2319 | 1.921 |
| 2320 | 3.048 |
| 2321 | 4.048 |
| 2322 | 5.048 |
| 2323 | 6.048 |
| 2324 | 7.048 |
| 2325 | 8.048 |
| 2326 | 9.068 |
| 2327 | 3.888 |
| 2328 | 4.908 |
| 2329 | 5.908 |
| 2330 | 6.908 |
| 2331 | 7.908 |
| 2332 | 8.908 |
| 2333 | 9.908 |
| 2334 | 10.908 |
| 2335 | 11.908 |
| 2336 | 12.908 |
| 2337 | 13.908 |
| 2338 | 14.908 |
| 2339 | 15.908 |
| 2340 | 12.808 |
| 2341 | 13.808 |
| 2342 | 14.808 |
| 2343 | 15.808 |
| 2344 | 16.842 |
| 2345 | 17.876 |
| 2346 | 5.41 |
| 2347 | 6.444 |
| 2348 | 7.478 |
| 2349 | 8.478 |
| 2350 | 9.478 |
| 2351 | 10.478 |
| 2352 | 11.478 |
| 2353 | 12.478 |
| 2354 | 5.69 |
| 2355 | 6.702 |
| 2356 | 7.714 |
| 2357 | 8.726 |
| 2358 | 9.738 |
| 2359 | 10.802 |
| 2360 | 11.866 |
| 2361 | 12.93 |
| 2362 | 0 |
| 2363 | 1.064 |
| 2364 | 2.064 |
| 2365 | 3.064 |
| 2366 | 4.104 |
| 2367 | 5.144 |
| 2368 | 0 |
| 2369 | 1.04 |
| 2370 | 2.08 |
| 2371 | 0 |
| 2372 | 1.04 |
| 2373 | 0 |
| 2374 | 1.002 |
| 2375 | 2.005 |
| 2376 | 3.007 |
| 2377 | 4.007 |
| 2378 | 5.007 |
| 2379 | 6.007 |
| 2380 | 7.007 |
| 2381 | 8.007 |
| 2382 | 9.007 |
| 2383 | 10.007 |
| 2384 | 11.007 |
| 2385 | 12.007 |
| 2386 | 13.118 |
| 2387 | 14.228 |
| 2388 | 15.338 |
| 2389 | 0 |
| 2390 | 1 |
| 2391 | 2 |
| 2392 | 3 |
| 2393 | 4 |
| 2394 | 5 |
| 2395 | 6 |
| 2396 | 7 |
| 2397 | 8 |
| 2398 | 9.044 |
| 2399 | 10.088 |
| 2400 | 11.132 |
| 2401 | 0 |
| 2402 | 1.044 |
| 2403 | 2.044 |
| 2404 | 3.044 |
| 2405 | 4.044 |
| 2406 | 5.044 |
| 2407 | 6.044 |
| 2408 | 7.044 |
| 2409 | 8.044 |
| 2410 | 9.044 |
| 2411 | 10.044 |
| 2412 | 11.044 |
| 2413 | 12.044 |
| 2414 | 13.044 |
| 2415 | 14.044 |
| 2416 | 15.044 |
| 2417 | 16.044 |
| 2418 | 17.044 |
| 2419 | 18.044 |
| 2420 | 9.068 |
| 2421 | 10.092 |
| 2422 | 11.116 |
| 2423 | 12.14 |
| 2424 | 13.14 |
| 2425 | 14.14 |
| 2426 | 15.14 |
| 2427 | 8.57 |
| 2428 | 9.6 |
| 2429 | 10.63 |
| 2430 | 11.63 |
| 2431 | 12.63 |
| 2432 | 13.63 |
| 2433 | 14.63 |
| 2434 | 15.63 |
| 2435 | 16.63 |
| 2436 | 17.63 |
| 2437 | 18.63 |
| 2438 | 19.63 |
| 2439 | 20.63 |
| 2440 | 21.63 |
| 2441 | 22.63 |
| 2442 | 23.698 |
| 2443 | 24.766 |
| 2444 | 25.834 |
| 2445 | 26.902 |
| 2446 | 5.97 |
| 2447 | 6.97 |
| 2448 | 7.97 |
| 2449 | 8.97 |
| 2450 | 9.97 |
| 2451 | 10.97 |
| 2452 | 11.97 |
| 2453 | 12.97 |
| 2454 | 14.09 |
| 2455 | 15.21 |
| 2456 | 16.33 |
| 2457 | 0 |
| 2458 | 1 |
| 2459 | 2 |
| 2460 | 3 |
| 2461 | 4 |
| 2462 | 5 |
| 2463 | 6 |
| 2464 | 7 |
| 2465 | 8 |
| 2466 | 9 |
| 2467 | 10 |
| 2468 | 11 |
| 2469 | 12 |
| 2470 | 13.21 |
| 2471 | 0 |
| 2472 | 1 |
| 2473 | 2 |
| 2474 | 3 |
| 2475 | 4 |
| 2476 | 5 |
| 2477 | 6 |
| 2478 | 7 |
| 2479 | 8 |
| 2480 | 9 |
| 2481 | 1.833 |
| 2482 | 2.867 |
| 2483 | 3.9 |
| 2484 | 0 |
| 2485 | 1.063 |
| 2486 | 2.127 |
| 2487 | 0 |
| 2488 | 1.005 |
| 2489 | 2.01 |
| 2490 | 3.015 |
| 2491 | 4.015 |
| 2492 | 5.015 |
| 2493 | 6.015 |
| 2494 | 7.015 |
| 2495 | 8.015 |
| 2496 | 9.015 |
| 2497 | 10.023 |
| 2498 | 4.031 |
| 2499 | 5.039 |
| 2500 | 6.047 |
| 2501 | 7.055 |
| 2502 | 8.055 |
| 2503 | 9.055 |
| 2504 | 10.055 |
| 2505 | 11.055 |
| 2506 | 12.055 |
| 2507 | 13.055 |
| 2508 | 14.055 |
| 2509 | 15.055 |
| 2510 | 16.055 |
| 2511 | 17.055 |
| 2512 | 18.055 |
| 2513 | 19.055 |
| 2514 | 20.055 |
| 2515 | 21.055 |
| 2516 | 22.055 |
| 2517 | 23.055 |
| 2518 | 24.055 |
| 2519 | 25.055 |
| 2520 | 26.055 |
| 2521 | 27.055 |
| 2522 | 28.055 |
| 2523 | 29.055 |
| 2524 | 30.055 |
| 2525 | 31.055 |
| 2526 | 32.055 |
| 2527 | 33.055 |
| 2528 | 34.055 |
| 2529 | 35.055 |
| 2530 | 36.055 |
| 2531 | 37.055 |
| 2532 | 38.055 |
| 2533 | 39.055 |
| 2534 | 40.055 |
| 2535 | 41.055 |
| 2536 | 42.055 |
| 2537 | 43.055 |
| 2538 | 44.055 |
| 2539 | 45.055 |
| 2540 | 46.055 |
| 2541 | 47.055 |
| 2542 | 48.055 |
| 2543 | 49.055 |
| 2544 | 50.055 |
| 2545 | 51.055 |
| 2546 | 52.055 |
| 2547 | 53.055 |
| 2548 | 54.055 |
| 2549 | 55.055 |
| 2550 | 56.055 |
| 2551 | 57.055 |
| 2552 | 58.055 |
| 2553 | 59.055 |
| 2554 | 60.055 |
| 2555 | 61.055 |
| 2556 | 62.055 |
| 2557 | 63.055 |
| 2558 | 64.055 |
| 2559 | 65.055 |
| 2560 | 66.055 |
| 2561 | 67.055 |
| 2562 | 68.055 |
| 2563 | 69.055 |
| 2564 | 70.055 |
| 2565 | 71.055 |
| 2566 | 72.063 |
| 2567 | 66.071 |
| 2568 | 67.079 |
| 2569 | 68.087 |
| 2570 | 69.095 |
| 2571 | 70.095 |
| 2572 | 71.095 |
| 2573 | 72.095 |
| 2574 | 73.095 |
| 2575 | 74.095 |
| 2576 | 69.9 |
| 2577 | 70.905 |
| 2578 | 71.91 |
| 2579 | 72.915 |
| 2580 | 73.967 |
| 2581 | 75.019 |
| 2582 | 76.071 |
| 2583 | 77.123 |
| 2584 | 60.175 |
| 2585 | 61.209 |
| 2586 | 62.243 |
| 2587 | 49.777 |
| 2588 | 50.811 |
| 2589 | 51.845 |
| 2590 | 52.845 |
| 2591 | 53.845 |
| 2592 | 54.845 |
| 2593 | 55.845 |
| 2594 | 56.845 |
| 2595 | 50.255 |
| 2596 | 51.265 |
| 2597 | 52.275 |
| 2598 | 53.285 |
| 2599 | 54.295 |
| 2600 | 55.295 |
| 2601 | 56.295 |
| 2602 | 57.295 |
| 2603 | 58.295 |
| 2604 | 59.295 |
| 2605 | 60.295 |
| 2606 | 61.295 |
| 2607 | 62.295 |
| 2608 | 63.295 |
| 2609 | 64.295 |
| 2610 | 65.295 |
| 2611 | 51.375 |
| 2612 | 52.455 |
| 2613 | 53.535 |
| 2614 | 54.535 |
| 2615 | 55.535 |
| 2616 | 56.535 |
| 2617 | 57.535 |
| 2618 | 58.575 |
| 2619 | 50.815 |
| 2620 | 51.855 |
| 2621 | 52.93 |
| 2622 | 54.005 |
| 2623 | 36.08 |
| 2624 | 37.155 |
| 2625 | 38.155 |
| 2626 | 39.155 |
| 2627 | 40.155 |
| 2628 | 41.155 |
| 2629 | 35.37 |
| 2630 | 36.385 |
| 2631 | 37.4 |
| 2632 | 38.415 |
| 2633 | 39.415 |
| 2634 | 40.415 |
| 2635 | 41.415 |
| 2636 | 42.415 |
| 2637 | 43.415 |
| 2638 | 44.415 |
| 2639 | 45.415 |
| 2640 | 46.415 |
| 2641 | 47.415 |
| 2642 | 48.415 |
| 2643 | 45.115 |
| 2644 | 46.115 |
| 2645 | 47.115 |
| 2646 | 48.115 |
| 2647 | 49.115 |
| 2648 | 50.115 |
| 2649 | 51.115 |
| 2650 | 52.115 |
| 2651 | 53.115 |
| 2652 | 54.115 |
| 2653 | 55.115 |
| 2654 | 56.115 |
| 2655 | 57.115 |
| 2656 | 58.115 |
| 2657 | 54.517 |
| 2658 | 55.52 |
| 2659 | 56.522 |
| 2660 | 57.525 |
| 2661 | 58.559 |
| 2662 | 59.593 |
| 2663 | 47.127 |
| 2664 | 48.161 |
| 2665 | 49.195 |
| 2666 | 50.195 |
| 2667 | 51.195 |
| 2668 | 43.617 |
| 2669 | 44.64 |
| 2670 | 45.662 |
| 2671 | 46.685 |
| 2672 | 47.685 |
| 2673 | 48.685 |
| 2674 | 49.685 |
| 2675 | 50.685 |
| 2676 | 51.685 |
| 2677 | 52.685 |
| 2678 | 53.685 |
| 2679 | 54.685 |
| 2680 | 55.685 |
| 2681 | 56.725 |
| 2682 | 57.765 |
| 2683 | 49.805 |
| 2684 | 50.805 |
| 2685 | 51.805 |
| 2686 | 52.805 |
| 2687 | 53.805 |
| 2688 | 54.805 |
| 2689 | 55.862 |
| 2690 | 56.92 |
| 2691 | 42.477 |
| 2692 | 43.535 |
| 2693 | 44.557 |
| 2694 | 45.58 |
| 2695 | 38.202 |
| 2696 | 39.225 |
| 2697 | 40.225 |
| 2698 | 41.225 |
| 2699 | 42.225 |
| 2700 | 43.225 |
| 2701 | 44.225 |
| 2702 | 45.225 |
| 2703 | 46.225 |
| 2704 | 47.225 |
| 2705 | 48.225 |
| 2706 | 49.225 |
| 2707 | 45.03 |
| 2708 | 46.035 |
| 2709 | 47.04 |
| 2710 | 48.045 |
| 2711 | 43.065 |
| 2712 | 44.085 |
| 2713 | 45.105 |
| 2714 | 46.105 |
| 2715 | 47.105 |
| 2716 | 48.105 |
| 2717 | 49.105 |
| 2718 | 50.105 |
| 2719 | 51.105 |
| 2720 | 52.105 |
| 2721 | 53.105 |
| 2722 | 43.129 |
| 2723 | 44.153 |
| 2724 | 45.177 |
| 2725 | 46.201 |
| 2726 | 47.225 |
| 2727 | 48.225 |
| 2728 | 49.225 |
| 2729 | 50.225 |
| 2730 | 51.225 |
| 2731 | 44.635 |
| 2732 | 45.645 |
| 2733 | 46.655 |
| 2734 | 47.665 |
| 2735 | 48.675 |
| 2736 | 49.675 |
| 2737 | 50.675 |
| 2738 | 51.675 |
| 2739 | 52.675 |
| 2740 | 53.675 |
| 2741 | 54.675 |
| 2742 | 55.675 |
| 2743 | 56.675 |
| 2744 | 57.675 |
| 2745 | 58.675 |
| 2746 | 59.675 |
| 2747 | 60.675 |
| 2748 | 61.675 |
| 2749 | 62.675 |
| 2750 | 63.675 |
| 2751 | 64.675 |
| 2752 | 65.675 |
| 2753 | 66.733 |
| 2754 | 67.791 |
| 2755 | 49.349 |
| 2756 | 50.407 |
| 2757 | 51.465 |
| 2758 | 52.465 |
| 2759 | 53.465 |
| 2760 | 54.465 |
| 2761 | 55.465 |
| 2762 | 56.465 |
| 2763 | 57.465 |
| 2764 | 58.465 |
| 2765 | 59.465 |
| 2766 | 60.465 |
| 2767 | 50.555 |
| 2768 | 51.645 |
| 2769 | 52.645 |
| 2770 | 53.645 |
| 2771 | 54.645 |
| 2772 | 55.645 |
| 2773 | 56.645 |
| 2774 | 57.717 |
| 2775 | 58.789 |
| 2776 | 59.861 |
| 2777 | 60.933 |
| 2778 | 39.005 |
| 2779 | 40.005 |
| 2780 | 41.005 |
| 2781 | 42.005 |
| 2782 | 43.005 |
| 2783 | 44.005 |
| 2784 | 45.045 |
| 2785 | 46.085 |
| 2786 | 35.125 |
| 2787 | 36.165 |
| 2788 | 37.165 |
| 2789 | 38.165 |
| 2790 | 39.165 |
| 2791 | 40.185 |
| 2792 | 35.205 |
| 2793 | 36.225 |
| 2794 | 37.225 |
| 2795 | 38.225 |
| 2796 | 39.225 |
| 2797 | 40.225 |
| 2798 | 41.225 |
| 2799 | 31.81 |
| 2800 | 32.895 |
| 2801 | 33.895 |
| 2802 | 34.895 |
| 2803 | 35.959 |
| 2804 | 37.023 |
| 2805 | 38.087 |
| 2806 | 18.151 |
| 2807 | 19.215 |
| 2808 | 20.229 |
| 2809 | 12.843 |
| 2810 | 13.857 |
| 2811 | 14.871 |
| 2812 | 15.885 |
| 2813 | 9.495 |
| 2814 | 10.505 |
| 2815 | 11.515 |
| 2816 | 12.525 |
| 2817 | 13.535 |
| 2818 | 14.535 |
| 2819 | 15.535 |
| 2820 | 16.535 |
| 2821 | 17.535 |
| 2822 | 18.535 |
| 2823 | 13.545 |
| 2824 | 14.555 |
| 2825 | 15.565 |
| 2826 | 16.575 |
| 2827 | 17.603 |
| 2828 | 18.631 |
| 2829 | 7.659 |
| 2830 | 8.687 |
| 2831 | 9.715 |
| 2832 | 10.715 |
| 2833 | 11.715 |
| 2834 | 6.725 |
| 2835 | 7.735 |
| 2836 | 8.745 |
| 2837 | 9.755 |
| 2838 | 5.768 |
| 2839 | 6.782 |
| 2840 | 7.795 |
| 2841 | 8.795 |
| 2842 | 9.795 |
| 2843 | 10.795 |
| 2844 | 11.795 |
| 2845 | 12.795 |
| 2846 | 13.795 |
| 2847 | 14.795 |
| 2848 | 15.795 |
| 2849 | 16.795 |
| 2850 | 17.795 |
| 2851 | 18.795 |
| 2852 | 19.795 |
| 2853 | 20.795 |
| 2854 | 21.795 |
| 2855 | 22.795 |
| 2856 | 23.795 |
| 2857 | 24.795 |
| 2858 | 25.795 |
| 2859 | 26.795 |
| 2860 | 27.795 |
| 2861 | 28.795 |
| 2862 | 29.795 |
| 2863 | 30.795 |
| 2864 | 31.795 |
| 2865 | 32.795 |
| 2866 | 33.795 |
| 2867 | 34.795 |
| 2868 | 35.795 |
| 2869 | 36.795 |
| 2870 | 37.795 |
| 2871 | 38.795 |
| 2872 | 39.795 |
| 2873 | 40.795 |
| 2874 | 41.795 |
| 2875 | 42.795 |
| 2876 | 43.795 |
| 2877 | 44.795 |
| 2878 | 45.795 |
| 2879 | 46.795 |
| 2880 | 47.795 |
| 2881 | 48.795 |
| 2882 | 49.795 |
| 2883 | 50.795 |
| 2884 | 42.865 |
| 2885 | 43.935 |
| 2886 | 44.935 |
| 2887 | 45.935 |
| 2888 | 46.935 |
| 2889 | 47.935 |
| 2890 | 48.935 |
| 2891 | 49.935 |
| 2892 | 50.935 |
| 2893 | 51.935 |
| 2894 | 52.935 |
| 2895 | 53.935 |
| 2896 | 54.935 |
| 2897 | 55.935 |
| 2898 | 56.935 |
| 2899 | 57.935 |
| 2900 | 58.935 |
| 2901 | 59.935 |
| 2902 | 60.935 |
| 2903 | 61.977 |
| 2904 | 63.019 |
| 2905 | 64.061 |
| 2906 | 65.103 |
| 2907 | 50.645 |
| 2908 | 51.645 |
| 2909 | 52.645 |
| 2910 | 48.655 |
| 2911 | 49.665 |
| 2912 | 50.675 |
| 2913 | 51.707 |
| 2914 | 39.739 |
| 2915 | 40.771 |
| 2916 | 41.803 |
| 2917 | 42.835 |
| 2918 | 30.369 |
| 2919 | 31.403 |
| 2920 | 32.437 |
| 2921 | 33.471 |
| 2922 | 34.505 |
| 2923 | 35.61 |
| 2924 | 36.715 |
| 2925 | 37.82 |
| 2926 | 13.925 |
| 2927 | 14.925 |
| 2928 | 15.925 |
| 2929 | 16.925 |
| 2930 | 17.925 |
| 2931 | 18.925 |
| 2932 | 12.137 |
| 2933 | 13.149 |
| 2934 | 14.161 |
| 2935 | 15.173 |
| 2936 | 16.185 |
| 2937 | 17.232 |
| 2938 | 18.278 |
| 2939 | 9.525 |
| 2940 | 10.525 |
| 2941 | 11.525 |
| 2942 | 12.525 |
| 2943 | 13.525 |
| 2944 | 14.525 |
| 2945 | 15.525 |
| 2946 | 16.525 |
| 2947 | 17.525 |
| 2948 | 18.525 |
| 2949 | 19.525 |
| 2950 | 20.525 |
| 2951 | 21.525 |
| 2952 | 22.525 |
| 2953 | 23.525 |
| 2954 | 24.525 |
| 2955 | 25.525 |
| 2956 | 22.545 |
| 2957 | 23.565 |
| 2958 | 24.565 |
| 2959 | 25.565 |
| 2960 | 26.565 |
| 2961 | 27.565 |
| 2962 | 28.565 |
| 2963 | 29.565 |
| 2964 | 30.565 |
| 2965 | 31.565 |
| 2966 | 32.565 |
| 2967 | 33.565 |
| 2968 | 34.565 |
| 2969 | 35.565 |
| 2970 | 36.565 |
| 2971 | 37.565 |
| 2972 | 38.565 |
| 2973 | 39.565 |
| 2974 | 26.103 |
| 2975 | 27.141 |
| 2976 | 28.179 |
| 2977 | 29.217 |
| 2978 | 30.255 |
| 2979 | 31.332 |
| 2980 | 32.408 |
| 2981 | 18.985 |
| 2982 | 8.511 |
| 2983 | 9.537 |
| 2984 | 10.563 |
| 2985 | 11.589 |
| 2986 | 12.615 |
| 2987 | 13.615 |
| 2988 | 14.615 |
| 2989 | 15.615 |
| 2990 | 16.615 |
| 2991 | 17.615 |
| 2992 | 18.615 |
| 2993 | 19.615 |
| 2994 | 20.615 |
| 2995 | 21.615 |
| 2996 | 22.653 |
| 2997 | 23.691 |
| 2998 | 10.229 |
| 2999 | 11.267 |
| 3000 | 12.305 |
| 3001 | 13.305 |
| 3002 | 14.305 |
| 3003 | 15.305 |
| 3004 | 16.305 |
| 3005 | 17.305 |
| 3006 | 18.305 |
| 3007 | 19.305 |
| 3008 | 20.305 |
| 3009 | 21.305 |
| 3010 | 22.305 |
| 3011 | 23.305 |
| 3012 | 24.305 |
| 3013 | 25.305 |
| 3014 | 26.305 |
| 3015 | 22.518 |
| 3016 | 23.532 |
| 3017 | 24.545 |
| 3018 | 25.545 |
| 3019 | 26.545 |
| 3020 | 27.608 |
| 3021 | 16.172 |
| 3022 | 17.235 |
| 3023 | 18.235 |
| 3024 | 19.235 |
| 3025 | 20.235 |
| 3026 | 21.235 |
| 3027 | 22.235 |
| 3028 | 23.297 |
| 3029 | 24.36 |
| 3030 | 8.922 |
| 3031 | 9.985 |
| 3032 | 11.019 |
| 3033 | 0 |
| 3034 | 1.034 |
| 3035 | 2.068 |
| 3036 | 3.102 |
| 3037 | 4.139 |
| 3038 | 5.177 |
| 3039 | 0 |
| 3040 | 1.038 |
| 3041 | 2.038 |
| 3042 | 3.038 |
| 3043 | 4.038 |
| 3044 | 5.038 |
| 3045 | 6.038 |
| 3046 | 7.038 |
| 3047 | 8.038 |
| 3048 | 9.038 |
| 3049 | 10.038 |
| 3050 | 11.038 |
| 3051 | 12.038 |
| 3052 | 13.038 |
| 3053 | 7.052 |
| 3054 | 8.067 |
| 3055 | 9.082 |
| 3056 | 10.097 |
| 3057 | 11.097 |
| 3058 | 12.097 |
| 3059 | 13.097 |
| 3060 | 14.097 |
| 3061 | 15.097 |
| 3062 | 16.097 |
| 3063 | 17.097 |
| 3064 | 18.097 |
| 3065 | 19.135 |
| 3066 | 20.173 |
| 3067 | 21.212 |
| 3068 | 7.75 |
| 3069 | 8.788 |
| 3070 | 9.788 |
| 3071 | 10.788 |
| 3072 | 11.788 |
| 3073 | 12.788 |
| 3074 | 13.832 |
| 3075 | 14.875 |
| 3076 | 0 |
| 3077 | 1.044 |
| 3078 | 2.088 |
| 3079 | 3.158 |
| 3080 | 0 |
| 3081 | 1.07 |
| 3082 | 2.14 |
| 3083 | 3.14 |
| 3084 | 4.14 |
| 3085 | 5.14 |
| 3086 | 6.176 |
| 3087 | 7.212 |
| 3088 | 0 |
| 3089 | 1.036 |
| 3090 | 2.072 |
| 3091 | 0 |
| 3092 | 1.058 |
| 3093 | 2.115 |
| 3094 | 3.173 |
| 3095 | 4.173 |
| 3096 | 5.173 |
| 3097 | 6.173 |
| 3098 | 7.173 |
| 3099 | 8.173 |
| 3100 | 9.173 |
| 3101 | 10.172 |
| 3102 | 11.172 |
| 3103 | 12.172 |
| 3104 | 13.172 |
| 3105 | 14.172 |
| 3106 | 15.172 |
| 3107 | 16.172 |
| 3108 | 17.172 |
| 3109 | 18.172 |
| 3110 | 19.232 |
| 3111 | 12.292 |
| 3112 | 13.292 |
| 3113 | 14.292 |
| 3114 | 6.509 |
| 3115 | 7.524 |
| 3116 | 8.54 |
| 3117 | 9.556 |
| 3118 | 10.572 |
| 3119 | 11.572 |
| 3120 | 12.572 |
| 3121 | 13.572 |
| 3122 | 14.572 |
| 3123 | 15.572 |
| 3124 | 16.572 |
| 3125 | 17.572 |
| 3126 | 18.572 |
| 3127 | 19.572 |
| 3128 | 20.572 |
| 3129 | 21.572 |
| 3130 | 13.2 |
| 3131 | 14.227 |
| 3132 | 15.255 |
| 3133 | 16.282 |
| 3134 | 5.342 |
| 3135 | 6.402 |
| 3136 | 7.462 |
| 3137 | 0 |
| 3138 | 1.03 |
| 3139 | 2.06 |
| 3140 | 3.09 |
| 3141 | 4.12 |
| 3142 | 5.12 |
| 3143 | 6.12 |
| 3144 | 7.12 |
| 3145 | 8.12 |
| 3146 | 9.12 |
| 3147 | 10.12 |
| 3148 | 11.12 |
| 3149 | 12.12 |
| 3150 | 13.12 |
| 3151 | 14.12 |
| 3152 | 15.12 |
| 3153 | 16.12 |
| 3154 | 17.12 |
| 3155 | 18.12 |
| 3156 | 19.167 |
| 3157 | 10.213 |
| 3158 | 11.26 |
| 3159 | 12.26 |
| 3160 | 13.26 |
| 3161 | 14.26 |
| 3162 | 15.26 |
| 3163 | 16.26 |
| 3164 | 17.26 |
| 3165 | 18.26 |
| 3166 | 19.26 |
| 3167 | 20.26 |
| 3168 | 21.26 |
| 3169 | 22.26 |
| 3170 | 23.26 |
| 3171 | 24.26 |
| 3172 | 25.287 |
| 3173 | 16.915 |
| 3174 | 17.942 |
| 3175 | 18.97 |
| 3176 | 19.97 |
| 3177 | 20.97 |
| 3178 | 21.97 |
| 3179 | 22.97 |
| 3180 | 23.97 |
| 3181 | 24.97 |
| 3182 | 25.97 |
| 3183 | 26.97 |
| 3184 | 27.992 |
| 3185 | 20.415 |
| 3186 | 21.437 |
| 3187 | 22.46 |
| 3188 | 23.46 |
| 3189 | 24.46 |
| 3190 | 25.46 |
| 3191 | 26.46 |
| 3192 | 27.46 |
| 3193 | 28.46 |
| 3194 | 29.46 |
| 3195 | 30.482 |
| 3196 | 23.105 |
| 3197 | 24.127 |
| 3198 | 25.15 |
| 3199 | 26.15 |
| 3200 | 27.15 |
| 3201 | 28.15 |
| 3202 | 29.15 |
| 3203 | 30.15 |
| 3204 | 31.15 |
| 3205 | 32.15 |
| 3206 | 33.15 |
| 3207 | 34.15 |
| 3208 | 35.18 |
| 3209 | 23.71 |
| 3210 | 24.74 |
| 3211 | 25.77 |
| 3212 | 26.8 |
| 3213 | 27.8 |
| 3214 | 28.8 |
| 3215 | 29.8 |
| 3216 | 30.8 |
| 3217 | 31.8 |
| 3218 | 32.8 |
| 3219 | 33.8 |
| 3220 | 34.8 |
| 3221 | 35.8 |
| 3222 | 36.8 |
| 3223 | 37.8 |
| 3224 | 38.8 |
| 3225 | 39.8 |
| 3226 | 40.8 |
| 3227 | 41.8 |
| 3228 | 42.8 |
| 3229 | 43.8 |
| 3230 | 44.8 |
| 3231 | 45.8 |
| 3232 | 46.8 |
| 3233 | 47.814 |
| 3234 | 40.228 |
| 3235 | 41.242 |
| 3236 | 42.256 |
| 3237 | 43.27 |
| 3238 | 37.078 |
| 3239 | 38.086 |
| 3240 | 39.094 |
| 3241 | 40.102 |
| 3242 | 41.11 |
| 3243 | 38.167 |
| 3244 | 39.173 |
| 3245 | 40.18 |
| 3246 | 41.18 |
| 3247 | 42.18 |
| 3248 | 37.2 |
| 3249 | 38.22 |
| 3250 | 39.24 |
| 3251 | 40.24 |
| 3252 | 41.24 |
| 3253 | 42.24 |
| 3254 | 43.24 |
| 3255 | 44.24 |
| 3256 | 45.24 |
| 3257 | 46.24 |
| 3258 | 47.24 |
| 3259 | 48.24 |
| 3260 | 49.24 |
| 3261 | 50.24 |
| 3262 | 51.24 |
| 3263 | 52.24 |
| 3264 | 53.24 |
| 3265 | 54.24 |
| 3266 | 55.275 |
| 3267 | 56.31 |
| 3268 | 46.345 |
| 3269 | 47.38 |
| 3270 | 48.38 |
| 3271 | 49.38 |
| 3272 | 50.38 |
| 3273 | 51.38 |
| 3274 | 52.38 |
| 3275 | 53.38 |
| 3276 | 54.38 |
| 3277 | 55.38 |
| 3278 | 45.902 |
| 3279 | 46.924 |
| 3280 | 47.946 |
| 3281 | 48.968 |
| 3282 | 49.99 |
| 3283 | 50.99 |
| 3284 | 51.99 |
| 3285 | 52.99 |
| 3286 | 53.99 |
| 3287 | 54.99 |
| 3288 | 55.99 |
| 3289 | 56.99 |
| 3290 | 57.99 |
| 3291 | 58.99 |
| 3292 | 59.99 |
| 3293 | 46.07 |
| 3294 | 47.15 |
| 3295 | 48.23 |
| 3296 | 49.23 |
| 3297 | 50.23 |
| 3298 | 51.23 |
| 3299 | 52.23 |
| 3300 | 53.23 |
| 3301 | 54.23 |
| 3302 | 55.23 |
| 3303 | 56.23 |
| 3304 | 57.23 |
| 3305 | 58.23 |
| 3306 | 59.23 |
| 3307 | 60.23 |
| 3308 | 61.23 |
| 3309 | 62.23 |
| 3310 | 63.23 |
| 3311 | 64.23 |
| 3312 | 65.29 |
| 3313 | 66.35 |
| 3314 | 51.41 |
| 3315 | 52.47 |
| 3316 | 53.47 |
| 3317 | 54.47 |
| 3318 | 55.47 |
| 3319 | 56.47 |
| 3320 | 57.47 |
| 3321 | 58.47 |
| 3322 | 59.47 |
| 3323 | 60.47 |
| 3324 | 61.47 |
| 3325 | 54.49 |
| 3326 | 55.51 |
| 3327 | 56.53 |
| 3328 | 57.55 |
| 3329 | 58.57 |
| 3330 | 51.39 |
| 3331 | 52.41 |
| 3332 | 53.43 |
| 3333 | 54.464 |
| 3334 | 55.498 |
| 3335 | 56.532 |
| 3336 | 44.066 |
| 3337 | 45.1 |
| 3338 | 46.12 |
| 3339 | 37.14 |
| 3340 | 38.16 |
| 3341 | 39.18 |
| 3342 | 40.2 |
| 3343 | 41.2 |
| 3344 | 42.2 |
| 3345 | 43.263 |
| 3346 | 31.827 |
| 3347 | 32.89 |
| 3348 | 33.89 |
| 3349 | 34.89 |
| 3350 | 35.89 |
| 3351 | 36.89 |
| 3352 | 37.89 |
| 3353 | 38.89 |
| 3354 | 39.89 |
| 3355 | 40.89 |
| 3356 | 41.89 |
| 3357 | 42.89 |
| 3358 | 43.89 |
| 3359 | 44.89 |
| 3360 | 45.89 |
| 3361 | 46.89 |
| 3362 | 47.89 |
| 3363 | 48.895 |
| 3364 | 45.295 |
| 3365 | 46.3 |
| 3366 | 47.305 |
| 3367 | 48.305 |
| 3368 | 49.305 |
| 3369 | 50.305 |
| 3370 | 51.305 |
| 3371 | 52.305 |
| 3372 | 53.351 |
| 3373 | 54.397 |
| 3374 | 55.443 |
| 3375 | 39.989 |
| 3376 | 41.035 |
| 3377 | 42.035 |
| 3378 | 43.035 |
| 3379 | 44.035 |
| 3380 | 45.035 |
| 3381 | 46.035 |
| 3382 | 47.095 |
| 3383 | 48.155 |
| 3384 | 49.215 |
| 3385 | 34.275 |
| 3386 | 35.275 |
| 3387 | 36.275 |
| 3388 | 37.275 |
| 3389 | 38.275 |
| 3390 | 39.275 |
| 3391 | 40.275 |
| 3392 | 41.275 |
| 3393 | 42.275 |
| 3394 | 43.275 |
| 3395 | 44.275 |
| 3396 | 45.275 |
| 3397 | 46.275 |
| 3398 | 47.275 |
| 3399 | 43.505 |
| 3400 | 44.535 |
| 3401 | 45.535 |
| 3402 | 46.535 |
| 3403 | 47.535 |
| 3404 | 48.535 |
| 3405 | 49.597 |
| 3406 | 50.66 |
| 3407 | 51.722 |
| 3408 | 36.285 |
| 3409 | 37.285 |
| 3410 | 38.285 |
| 3411 | 39.285 |
| 3412 | 40.285 |
| 3413 | 41.285 |
| 3414 | 42.285 |
| 3415 | 43.285 |
| 3416 | 44.285 |
| 3417 | 45.285 |
| 3418 | 46.285 |
| 3419 | 47.285 |
| 3420 | 48.285 |
| 3421 | 49.285 |
| 3422 | 42.505 |
| 3423 | 43.525 |
| 3424 | 44.545 |
| 3425 | 45.565 |
| 3426 | 46.62 |
| 3427 | 47.675 |
| 3428 | 48.73 |
| 3429 | 34.785 |
| 3430 | 35.785 |
| 3431 | 36.785 |
| 3432 | 37.785 |
| 3433 | 38.785 |
| 3434 | 39.785 |
| 3435 | 40.785 |
| 3436 | 41.785 |
| 3437 | 42.785 |
| 3438 | 43.785 |
| 3439 | 44.785 |
| 3440 | 45.785 |
| 3441 | 46.785 |
| 3442 | 47.785 |
| 3443 | 48.785 |
| 3444 | 49.785 |
| 3445 | 50.785 |
| 3446 | 51.785 |
| 3447 | 52.785 |
| 3448 | 53.785 |
| 3449 | 47.993 |
| 3450 | 49.001 |
| 3451 | 50.009 |
| 3452 | 51.017 |
| 3453 | 52.025 |
| 3454 | 53.025 |
| 3455 | 54.025 |
| 3456 | 55.025 |
| 3457 | 56.025 |
| 3458 | 57.025 |
| 3459 | 58.025 |
| 3460 | 59.025 |
| 3461 | 60.025 |
| 3462 | 61.025 |
| 3463 | 62.025 |
| 3464 | 63.025 |
| 3465 | 64.025 |
| 3466 | 65.025 |
| 3467 | 66.025 |
| 3468 | 67.025 |
| 3469 | 68.025 |
| 3470 | 69.025 |
| 3471 | 70.025 |
| 3472 | 71.025 |
| 3473 | 72.025 |
| 3474 | 73.025 |
| 3475 | 74.025 |
| 3476 | 75.025 |
| 3477 | 76.025 |
| 3478 | 77.025 |
| 3479 | 78.025 |
| 3480 | 79.025 |
| 3481 | 80.025 |
| 3482 | 81.025 |
| 3483 | 82.025 |
| 3484 | 83.025 |
| 3485 | 84.025 |
| 3486 | 85.025 |
| 3487 | 86.025 |
| 3488 | 87.025 |
| 3489 | 88.025 |
| 3490 | 89.025 |
| 3491 | 90.025 |
| 3492 | 91.025 |
| 3493 | 92.025 |
| 3494 | 93.025 |
| 3495 | 94.025 |
| 3496 | 95.025 |
| 3497 | 96.025 |
| 3498 | 97.025 |
| 3499 | 98.025 |
| 3500 | 99.025 |
| 3501 | 100.025 |
| 3502 | 101.025 |
| 3503 | 102.025 |
| 3504 | 103.025 |
| 3505 | 104.025 |
| 3506 | 105.053 |
| 3507 | 106.081 |
| 3508 | 95.109 |
| 3509 | 96.137 |
| 3510 | 97.165 |
| 3511 | 98.165 |
| 3512 | 99.165 |
| 3513 | 100.165 |
| 3514 | 101.165 |
| 3515 | 102.365 |
| 3516 | 81.565 |
| 3517 | 82.565 |
| 3518 | 83.565 |
| 3519 | 84.565 |
| 3520 | 85.565 |
| 3521 | 86.565 |
| 3522 | 81.375 |
| 3523 | 82.385 |
| 3524 | 83.395 |
| 3525 | 84.405 |
| 3526 | 85.405 |
| 3527 | 86.405 |
| 3528 | 87.405 |
| 3529 | 88.405 |
| 3530 | 89.405 |
| 3531 | 90.405 |
| 3532 | 91.405 |
| 3533 | 92.405 |
| 3534 | 93.405 |
| 3535 | 94.405 |
| 3536 | 89.812 |
| 3537 | 90.82 |
| 3538 | 91.827 |
| 3539 | 92.835 |
| 3540 | 88.765 |
| 3541 | 89.795 |
| 3542 | 90.795 |
| 3543 | 91.795 |
| 3544 | 92.795 |
| 3545 | 93.795 |
| 3546 | 94.795 |
| 3547 | 95.795 |
| 3548 | 96.795 |
| 3549 | 97.795 |
| 3550 | 98.795 |
| 3551 | 99.795 |
| 3552 | 100.795 |
| 3553 | 101.795 |
| 3554 | 102.795 |
| 3555 | 103.795 |
| 3556 | 104.795 |
| 3557 | 105.795 |
| 3558 | 99.25 |
| 3559 | 100.305 |
| 3560 | 95.515 |
| 3561 | 96.525 |
| 3562 | 97.535 |
| 3563 | 98.545 |
| 3564 | 99.545 |
| 3565 | 100.545 |
| 3566 | 101.545 |
| 3567 | 102.635 |
| 3568 | 92.725 |
| 3569 | 93.725 |
| 3570 | 94.725 |
| 3571 | 95.725 |
| 3572 | 96.725 |
| 3573 | 97.725 |
| 3574 | 98.725 |
| 3575 | 99.725 |
| 3576 | 100.725 |
| 3577 | 101.725 |
| 3578 | 102.725 |
| 3579 | 103.725 |
| 3580 | 104.725 |
| 3581 | 105.725 |
| 3582 | 106.725 |
| 3583 | 107.725 |
| 3584 | 108.85 |
| 3585 | 109.975 |
| 3586 | 111.1 |
| 3587 | 83.225 |
| 3588 | 84.225 |
| 3589 | 85.225 |
| 3590 | 86.279 |
| 3591 | 87.333 |
| 3592 | 88.387 |
| 3593 | 70.941 |
| 3594 | 71.995 |
| 3595 | 59.565 |
| 3596 | 60.635 |
| 3597 | 61.705 |
| 3598 | 62.705 |
| 3599 | 63.705 |
| 3600 | 64.705 |
| 3601 | 65.705 |
| 3602 | 66.705 |
| 3603 | 62.51 |
| 3604 | 63.515 |
| 3605 | 64.52 |
| 3606 | 65.525 |
| 3607 | 66.593 |
| 3608 | 67.661 |
| 3609 | 68.729 |
| 3610 | 47.797 |
| 3611 | 48.865 |
| 3612 | 49.998 |
| 3613 | 51.132 |
| 3614 | 29.265 |
| 3615 | 21.687 |
| 3616 | 22.71 |
| 3617 | 23.732 |
| 3618 | 24.755 |
| 3619 | 25.845 |
| 3620 | 26.935 |
| 3621 | 11.525 |
| 3622 | 12.525 |
| 3623 | 13.525 |
| 3624 | 14.525 |
| 3625 | 15.525 |
| 3626 | 16.745 |
| 3627 | 0 |
| 3628 | 1 |
| 3629 | 2 |
| 3630 | 3 |
| 3631 | 0 |
| 3632 | 1.07 |
| 3633 | 2.07 |
| 3634 | 3.07 |
| 3635 | 4.07 |
| 3636 | 5.07 |
| 3637 | 6.24 |
| 3638 | 0 |
| 3639 | 0 |
| 3640 | 1.013 |
| 3641 | 2.027 |
| 3642 | 3.057 |
| 3643 | 4.087 |
| 3644 | 0 |
| 3645 | 1.03 |
| 3646 | 2.03 |
| 3647 | 3.03 |
| 3648 | 4.03 |
| 3649 | 5.03 |
| 3650 | 6.03 |
| 3651 | 7.23 |
| 3652 | 0 |
| 3653 | 1 |
| 3654 | 2 |
| 3655 | 3 |
| 3656 | 4 |
| 3657 | 5 |
| 3658 | 6 |
| 3659 | 7 |
| 3660 | 8 |
| 3661 | 9 |
| 3662 | 10 |
| 3663 | 11 |
| 3664 | 12.045 |
| 3665 | 6.69 |
| 3666 | 7.69 |
| 3667 | 8.69 |
| 3668 | 9.69 |
| 3669 | 10.69 |
| 3670 | 11.69 |
| 3671 | 12.69 |
| 3672 | 13.69 |
| 3673 | 14.69 |
| 3674 | 15.69 |
| 3675 | 16.69 |
| 3676 | 17.69 |
| 3677 | 18.69 |
| 3678 | 19.69 |
| 3679 | 20.69 |
| 3680 | 21.69 |
| 3681 | 22.69 |
| 3682 | 23.69 |
| 3683 | 24.69 |
| 3684 | 25.69 |
| 3685 | 26.69 |
| 3686 | 27.69 |
| 3687 | 28.69 |
| 3688 | 29.69 |
| 3689 | 30.69 |
| 3690 | 31.69 |
| 3691 | 32.69 |
| 3692 | 33.69 |
| 3693 | 34.69 |
| 3694 | 35.69 |
| 3695 | 36.97 |
| 3696 | 8.25 |
| 3697 | 1.083 |
| 3698 | 2.117 |
| 3699 | 3.15 |
| 3700 | 4.15 |
| 3701 | 5.15 |
| 3702 | 6.15 |
| 3703 | 7.15 |
| 3704 | 8.15 |
| 3705 | 9.15 |
| 3706 | 10.15 |
| 3707 | 11.15 |
| 3708 | 12.15 |
| 3709 | 13.15 |
| 3710 | 14.15 |
| 3711 | 15.15 |
| 3712 | 16.15 |
| 3713 | 17.15 |
| 3714 | 18.53 |
| 3715 | 19.91 |
| 3716 | 0 |
| 3717 | 1 |
| 3718 | 2 |
| 3719 | 3 |
| 3720 | 4 |
| 3721 | 5 |
| 3722 | 6 |
| 3723 | 7 |
| 3724 | 8 |
| 3725 | 9 |
| 3726 | 10 |
| 3727 | 11 |
| 3728 | 12 |
| 3729 | 13 |
| 3730 | 14 |
| 3731 | 15 |
| 3732 | 16.008 |
| 3733 | 10.216 |
| 3734 | 11.224 |
| 3735 | 12.232 |
| 3736 | 13.24 |
| 3737 | 14.29 |
| 3738 | 15.34 |
| 3739 | 5.89 |
| 3740 | 6.89 |
| 3741 | 7.89 |
| 3742 | 8.89 |
| 3743 | 9.89 |
| 3744 | 10.89 |
| 3745 | 11.89 |
| 3746 | 12.89 |
| 3747 | 13.89 |
| 3748 | 14.89 |
| 3749 | 15.89 |
| 3750 | 16.89 |
| 3751 | 17.89 |
| 3752 | 18.89 |
| 3753 | 19.89 |
| 3754 | 20.89 |
| 3755 | 21.89 |
| 3756 | 22.89 |
| 3757 | 23.89 |
| 3758 | 24.89 |
| 3759 | 25.89 |
| 3760 | 26.89 |
| 3761 | 27.89 |
| 3762 | 28.89 |
| 3763 | 29.89 |
| 3764 | 30.89 |
| 3765 | 31.89 |
| 3766 | 32.89 |
| 3767 | 33.89 |
| 3768 | 34.89 |
| 3769 | 35.89 |
| 3770 | 36.923 |
| 3771 | 29.957 |
| 3772 | 30.99 |
| 3773 | 31.99 |
| 3774 | 32.99 |
| 3775 | 34.05 |
| 3776 | 27.31 |
| 3777 | 28.355 |
| 3778 | 16.4 |
| 3779 | 17.445 |
| 3780 | 18.49 |
| 3781 | 19.49 |
| 3782 | 20.49 |
| 3783 | 21.49 |
| 3784 | 22.49 |
| 3785 | 23.53 |
| 3786 | 18.57 |
| 3787 | 15.895 |
| 3788 | 16.895 |
| 3789 | 17.895 |
| 3790 | 18.895 |
| 3791 | 19.895 |
| 3792 | 20.895 |
| 3793 | 21.895 |
| 3794 | 22.895 |
| 3795 | 23.928 |
| 3796 | 16.762 |
| 3797 | 17.795 |
| 3798 | 18.795 |
| 3799 | 19.795 |
| 3800 | 20.795 |
| 3801 | 21.795 |
| 3802 | 14.855 |
| 3803 | 15.915 |
| 3804 | 10.935 |
| 3805 | 11.955 |
| 3806 | 12.975 |
| 3807 | 13.975 |
| 3808 | 14.975 |
| 3809 | 15.975 |
| 3810 | 16.975 |
| 3811 | 17.975 |
| 3812 | 18.975 |
| 3813 | 19.975 |
| 3814 | 20.975 |
| 3815 | 21.975 |
| 3816 | 22.975 |
| 3817 | 23.975 |
| 3818 | 24.975 |
| 3819 | 25.975 |
| 3820 | 26.975 |
| 3821 | 27.975 |
| 3822 | 28.975 |
| 3823 | 29.975 |
| 3824 | 30.975 |
| 3825 | 31.975 |
| 3826 | 32.975 |
| 3827 | 33.975 |
| 3828 | 34.975 |
| 3829 | 35.975 |
| 3830 | 36.975 |
| 3831 | 37.975 |
| 3832 | 38.975 |
| 3833 | 39.975 |
| 3834 | 40.975 |
| 3835 | 41.975 |
| 3836 | 42.987 |
| 3837 | 35.999 |
| 3838 | 37.011 |
| 3839 | 38.023 |
| 3840 | 39.035 |
| 3841 | 40.035 |
| 3842 | 41.035 |
| 3843 | 42.035 |
| 3844 | 43.035 |
| 3845 | 44.035 |
| 3846 | 45.035 |
| 3847 | 46.035 |
| 3848 | 47.035 |
| 3849 | 48.035 |
| 3850 | 49.035 |
| 3851 | 50.035 |
| 3852 | 51.035 |
| 3853 | 52.035 |
| 3854 | 53.035 |
| 3855 | 54.035 |
| 3856 | 55.035 |
| 3857 | 56.035 |
| 3858 | 57.035 |
| 3859 | 58.035 |
| 3860 | 59.035 |
| 3861 | 60.035 |
| 3862 | 61.035 |
| 3863 | 62.035 |
| 3864 | 63.08 |
| 3865 | 57.525 |
| 3866 | 58.525 |
| 3867 | 59.525 |
| 3868 | 60.587 |
| 3869 | 61.65 |
| 3870 | 46.212 |
| 3871 | 47.275 |
| 3872 | 48.275 |
| 3873 | 49.275 |
| 3874 | 50.275 |
| 3875 | 51.275 |
| 3876 | 52.275 |
| 3877 | 53.275 |
| 3878 | 54.275 |
| 3879 | 55.275 |
| 3880 | 56.275 |
| 3881 | 57.275 |
| 3882 | 58.275 |
| 3883 | 59.275 |
| 3884 | 60.275 |
| 3885 | 61.275 |
| 3886 | 62.275 |
| 3887 | 63.275 |
| 3888 | 64.275 |
| 3889 | 65.275 |
| 3890 | 66.275 |
| 3891 | 67.295 |
| 3892 | 60.315 |
| 3893 | 61.335 |
| 3894 | 62.355 |
| 3895 | 63.355 |
| 3896 | 64.355 |
| 3897 | 65.355 |
| 3898 | 66.355 |
| 3899 | 67.355 |
| 3900 | 68.355 |
| 3901 | 69.355 |
| 3902 | 70.355 |
| 3903 | 71.355 |
| 3904 | 67.965 |
| 3905 | 68.975 |
| 3906 | 69.985 |
| 3907 | 71.062 |
| 3908 | 57.638 |
| 3909 | 58.715 |
| 3910 | 59.715 |
| 3911 | 60.715 |
| 3912 | 61.715 |
| 3913 | 62.715 |
| 3914 | 63.715 |
| 3915 | 64.715 |
| 3916 | 65.715 |
| 3917 | 66.715 |
| 3918 | 67.715 |
| 3919 | 68.715 |
| 3920 | 69.715 |
| 3921 | 70.715 |
| 3922 | 71.715 |
| 3923 | 72.715 |
| 3924 | 73.715 |
| 3925 | 74.715 |
| 3926 | 75.715 |
| 3927 | 76.715 |
| 3928 | 77.715 |
| 3929 | 78.715 |
| 3930 | 79.715 |
| 3931 | 80.715 |
| 3932 | 81.715 |
| 3933 | 82.715 |
| 3934 | 83.715 |
| 3935 | 84.715 |
| 3936 | 85.715 |
| 3937 | 86.715 |
| 3938 | 87.715 |
| 3939 | 88.715 |
| 3940 | 89.715 |
| 3941 | 90.715 |
| 3942 | 91.715 |
| 3943 | 86.825 |
| 3944 | 87.835 |
| 3945 | 88.845 |
| 3946 | 89.855 |
| 3947 | 90.855 |
| 3948 | 91.855 |
| 3949 | 92.855 |
| 3950 | 93.855 |
| 3951 | 94.855 |
| 3952 | 95.855 |
| 3953 | 96.855 |
| 3954 | 94.47 |
| 3955 | 95.485 |
| 3956 | 96.485 |
| 3957 | 97.485 |
| 3958 | 98.485 |
| 3959 | 99.485 |
| 3960 | 100.705 |
| 3961 | 77.925 |
| 3962 | 78.925 |
| 3963 | 79.925 |
| 3964 | 80.925 |
| 3965 | 81.925 |
| 3966 | 82.925 |
| 3967 | 83.925 |
| 3968 | 84.925 |
| 3969 | 85.925 |
| 3970 | 86.925 |
| 3971 | 88.015 |
| 3972 | 89.105 |
| 3973 | 73.695 |
| 3974 | 74.695 |
| 3975 | 75.695 |
| 3976 | 76.695 |
| 3977 | 77.695 |
| 3978 | 78.695 |
| 3979 | 79.695 |
| 3980 | 80.695 |
| 3981 | 81.695 |
| 3982 | 82.695 |
| 3983 | 83.695 |
| 3984 | 84.695 |
| 3985 | 85.695 |
| 3986 | 86.695 |
| 3987 | 87.695 |
| 3988 | 88.695 |
| 3989 | 89.695 |
| 3990 | 90.695 |
| 3991 | 91.695 |
| 3992 | 92.695 |
| 3993 | 93.695 |
| 3994 | 94.695 |
| 3995 | 95.695 |
| 3996 | 96.695 |
| 3997 | 97.695 |
| 3998 | 98.695 |
| 3999 | 99.695 |
| 4000 | 100.695 |
| 4001 | 101.695 |
| 4002 | 102.695 |
| 4003 | 103.695 |
| 4004 | 104.695 |
| 4005 | 105.695 |
| 4006 | 106.695 |
| 4007 | 107.695 |
| 4008 | 108.752 |
| 4009 | 98.308 |
| 4010 | 99.365 |
| 4011 | 100.365 |
| 4012 | 101.365 |
| 4013 | 102.365 |
| 4014 | 103.365 |
| 4015 | 104.365 |
| 4016 | 105.365 |
| 4017 | 106.365 |
| 4018 | 107.365 |
| 4019 | 108.365 |
| 4020 | 109.365 |
| 4021 | 110.365 |
| 4022 | 111.365 |
| 4023 | 112.365 |
| 4024 | 113.365 |
| 4025 | 114.365 |
| 4026 | 115.365 |
| 4027 | 116.365 |
| 4028 | 117.365 |
| 4029 | 118.365 |
| 4030 | 119.365 |
| 4031 | 120.365 |
| 4032 | 121.365 |
| 4033 | 103.535 |
| 4034 | 104.705 |
| 4035 | 105.705 |
| 4036 | 106.705 |
| 4037 | 107.705 |
| 4038 | 108.705 |
| 4039 | 109.705 |
| 4040 | 110.705 |
| 4041 | 111.705 |
| 4042 | 112.705 |
| 4043 | 113.705 |
| 4044 | 114.705 |
| 4045 | 115.705 |
| 4046 | 116.705 |
| 4047 | 117.705 |
| 4048 | 118.705 |
| 4049 | 119.705 |
| 4050 | 120.705 |
| 4051 | 121.705 |
| 4052 | 122.705 |
| 4053 | 123.705 |
| 4054 | 124.705 |
| 4055 | 125.705 |
| 4056 | 126.705 |
| 4057 | 127.705 |
| 4058 | 128.705 |
| 4059 | 129.705 |
| 4060 | 130.705 |
| 4061 | 131.705 |
| 4062 | 132.705 |
| 4063 | 133.705 |
| 4064 | 134.705 |
| 4065 | 135.705 |
| 4066 | 136.705 |
| 4067 | 137.705 |
| 4068 | 138.705 |
| 4069 | 139.705 |
| 4070 | 140.705 |
| 4071 | 141.705 |
| 4072 | 142.705 |
| 4073 | 143.705 |
| 4074 | 144.705 |
| 4075 | 145.705 |
| 4076 | 146.705 |
| 4077 | 147.705 |
| 4078 | 148.705 |
| 4079 | 149.705 |
| 4080 | 150.705 |
| 4081 | 151.705 |
| 4082 | 152.845 |
| 4083 | 137.985 |
| 4084 | 132.825 |
| 4085 | 133.865 |
| 4086 | 134.865 |
| 4087 | 135.865 |
| 4088 | 136.865 |
| 4089 | 137.865 |
| 4090 | 133.572 |
| 4091 | 134.58 |
| 4092 | 135.587 |
| 4093 | 136.595 |
| 4094 | 137.625 |
| 4095 | 131.055 |
| 4096 | 132.085 |
| 4097 | 133.085 |
| 4098 | 134.085 |
| 4099 | 135.085 |
| 4100 | 136.085 |
| 4101 | 137.085 |
| 4102 | 132.702 |
| 4103 | 133.718 |
| 4104 | 134.735 |
| 4105 | 135.735 |
| 4106 | 136.735 |
| 4107 | 137.735 |
| 4108 | 138.735 |
| 4109 | 139.735 |
| 4110 | 140.735 |
| 4111 | 141.735 |
| 4112 | 142.735 |
| 4113 | 143.735 |
| 4114 | 144.735 |
| 4115 | 145.735 |
| 4116 | 146.735 |
| 4117 | 147.735 |
| 4118 | 148.735 |
| 4119 | 149.735 |
| 4120 | 150.735 |
| 4121 | 151.735 |
| 4122 | 152.735 |
| 4123 | 153.735 |
| 4124 | 154.735 |
| 4125 | 155.735 |
| 4126 | 156.735 |
| 4127 | 157.798 |
| 4128 | 146.362 |
| 4129 | 147.425 |
| 4130 | 148.425 |
| 4131 | 149.425 |
| 4132 | 150.425 |
| 4133 | 151.425 |
| 4134 | 152.425 |
| 4135 | 153.425 |
| 4136 | 154.425 |
| 4137 | 155.425 |
| 4138 | 156.425 |
| 4139 | 157.425 |
| 4140 | 158.425 |
| 4141 | 159.425 |
| 4142 | 160.425 |
| 4143 | 161.425 |
| 4144 | 162.425 |
| 4145 | 163.425 |
| 4146 | 164.425 |
| 4147 | 165.425 |
| 4148 | 166.425 |
| 4149 | 167.425 |
| 4150 | 168.425 |
| 4151 | 169.425 |
| 4152 | 170.425 |
| 4153 | 171.425 |
| 4154 | 172.425 |
| 4155 | 173.425 |
| 4156 | 174.425 |
| 4157 | 175.425 |
| 4158 | 176.425 |
| 4159 | 177.425 |
| 4160 | 178.425 |
| 4161 | 179.425 |
| 4162 | 180.425 |
| 4163 | 181.425 |
| 4164 | 182.425 |
| 4165 | 183.425 |
| 4166 | 184.425 |
| 4167 | 185.425 |
| 4168 | 186.425 |
| 4169 | 187.425 |
| 4170 | 188.425 |
| 4171 | 189.425 |
| 4172 | 190.425 |
| 4173 | 191.425 |
| 4174 | 192.425 |
| 4175 | 193.425 |
| 4176 | 194.425 |
| 4177 | 195.425 |
| 4178 | 196.425 |
| 4179 | 197.525 |
| 4180 | 198.625 |
| 4181 | 175.725 |
| 4182 | 176.825 |
| 4183 | 177.825 |
| 4184 | 178.825 |
| 4185 | 179.825 |
| 4186 | 180.825 |
| 4187 | 181.825 |
| 4188 | 182.825 |
| 4189 | 183.825 |
| 4190 | 184.825 |
| 4191 | 185.825 |
| 4192 | 186.825 |
| 4193 | 187.825 |
| 4194 | 188.825 |
| 4195 | 189.825 |
| 4196 | 190.825 |
| 4197 | 191.825 |
| 4198 | 192.825 |
| 4199 | 193.825 |
| 4200 | 194.825 |
| 4201 | 195.84 |
| 4202 | 190.055 |
| 4203 | 191.07 |
| 4204 | 192.085 |
| 4205 | 193.085 |
| 4206 | 194.085 |
| 4207 | 195.085 |
| 4208 | 196.085 |
| 4209 | 174.18 |
| 4210 | 175.275 |
| 4211 | 176.37 |
| 4212 | 177.465 |
| 4213 | 178.487 |
| 4214 | 171.11 |
| 4215 | 172.132 |
| 4216 | 173.155 |
| 4217 | 169.955 |
| 4218 | 170.955 |
| 4219 | 171.955 |
| 4220 | 172.955 |
| 4221 | 173.955 |
| 4222 | 174.955 |
| 4223 | 175.955 |
| 4224 | 176.955 |
| 4225 | 177.955 |
| 4226 | 178.955 |
| 4227 | 179.955 |
| 4228 | 180.955 |
| 4229 | 181.955 |
| 4230 | 182.955 |
| 4231 | 183.955 |
| 4232 | 184.955 |
| 4233 | 185.955 |
| 4234 | 186.955 |
| 4235 | 187.955 |
| 4236 | 189.005 |
| 4237 | 190.055 |
| 4238 | 191.105 |
| 4239 | 178.155 |
| 4240 | 172.767 |
| 4241 | 173.78 |
| 4242 | 174.792 |
| 4243 | 175.805 |
| 4244 | 176.805 |
| 4245 | 177.805 |
| 4246 | 178.805 |
| 4247 | 179.805 |
| 4248 | 180.805 |
| 4249 | 181.805 |
| 4250 | 182.805 |
| 4251 | 183.805 |
| 4252 | 184.805 |
| 4253 | 185.805 |
| 4254 | 186.805 |
| 4255 | 187.805 |
| 4256 | 188.805 |
| 4257 | 189.805 |
| 4258 | 190.805 |
| 4259 | 185.845 |
| 4260 | 186.885 |
| 4261 | 187.885 |
| 4262 | 188.885 |
| 4263 | 185.692 |
| 4264 | 186.698 |
| 4265 | 187.705 |
| 4266 | 188.705 |
| 4267 | 189.705 |
| 4268 | 190.705 |
| 4269 | 191.705 |
| 4270 | 192.705 |
| 4271 | 193.762 |
| 4272 | 183.318 |
| 4273 | 184.375 |
| 4274 | 185.375 |
| 4275 | 186.375 |
| 4276 | 187.375 |
| 4277 | 188.375 |
| 4278 | 189.375 |
| 4279 | 190.375 |
| 4280 | 191.375 |
| 4281 | 192.375 |
| 4282 | 193.375 |
| 4283 | 194.375 |
| 4284 | 195.375 |
| 4285 | 196.375 |
| 4286 | 197.375 |
| 4287 | 198.375 |
| 4288 | 199.375 |
| 4289 | 200.375 |
| 4290 | 201.375 |
| 4291 | 202.375 |
| 4292 | 203.375 |
| 4293 | 204.375 |
| 4294 | 205.47 |
| 4295 | 195.065 |
| 4296 | 196.132 |
| 4297 | 197.198 |
| 4298 | 186.27 |
| 4299 | 187.27 |
| 4300 | 188.27 |
| 4301 | 189.27 |
| 4302 | 190.27 |
| 4303 | 191.27 |
| 4304 | 192.27 |
| 4305 | 193.27 |
| 4306 | 194.27 |
| 4307 | 195.27 |
| 4308 | 189.497 |
| 4309 | 190.523 |
| 4310 | 191.55 |
| 4311 | 192.63 |
| 4312 | 193.71 |
| 4313 | 179.79 |
| 4314 | 180.79 |
| 4315 | 181.79 |
| 4316 | 182.79 |
| 4317 | 183.79 |
| 4318 | 184.79 |
| 4319 | 185.79 |
| 4320 | 181.197 |
| 4321 | 182.205 |
| 4322 | 183.212 |
| 4323 | 184.22 |
| 4324 | 185.22 |
| 4325 | 186.22 |
| 4326 | 187.22 |
| 4327 | 188.22 |
| 4328 | 189.22 |
| 4329 | 190.22 |
| 4330 | 191.22 |
| 4331 | 192.277 |
| 4332 | 193.335 |
| 4333 | 178.892 |
| 4334 | 179.95 |
| 4335 | 180.98 |
| 4336 | 172.01 |
| 4337 | 173.04 |
| 4338 | 174.07 |
| 4339 | 175.112 |
| 4340 | 176.155 |
| 4341 | 164.697 |
| 4342 | 165.74 |
| 4343 | 166.74 |
| 4344 | 167.74 |
| 4345 | 168.74 |
| 4346 | 169.74 |
| 4347 | 170.792 |
| 4348 | 157.345 |
| 4349 | 158.397 |
| 4350 | 159.45 |
| 4351 | 146.5 |
| 4352 | 147.55 |
| 4353 | 148.6 |
| 4354 | 149.65 |
| 4355 | 150.65 |
| 4356 | 151.65 |
| 4357 | 152.65 |
| 4358 | 153.65 |
| 4359 | 154.65 |
| 4360 | 155.65 |
| 4361 | 156.65 |
| 4362 | 157.65 |
| 4363 | 158.65 |
| 4364 | 159.65 |
| 4365 | 160.65 |
| 4366 | 161.65 |
| 4367 | 162.65 |
| 4368 | 159.26 |
| 4369 | 160.27 |
| 4370 | 161.28 |
| 4371 | 156.887 |
| 4372 | 157.895 |
| 4373 | 158.902 |
| 4374 | 159.91 |
| 4375 | 160.91 |
| 4376 | 161.91 |
| 4377 | 162.91 |
| 4378 | 163.91 |
| 4379 | 164.91 |
| 4380 | 165.91 |
| 4381 | 152.462 |
| 4382 | 153.515 |
| 4383 | 154.567 |
| 4384 | 155.62 |
| 4385 | 156.62 |
| 4386 | 157.62 |
| 4387 | 158.62 |
| 4388 | 159.62 |
| 4389 | 160.62 |
| 4390 | 161.62 |
| 4391 | 162.62 |
| 4392 | 163.62 |
| 4393 | 164.62 |
| 4394 | 160.255 |
| 4395 | 161.29 |
| 4396 | 162.4 |
| 4397 | 163.51 |
| 4398 | 145.12 |
| 4399 | 146.12 |
| 4400 | 147.12 |
| 4401 | 143.422 |
| 4402 | 144.425 |
| 4403 | 145.427 |
| 4404 | 146.43 |
| 4405 | 147.43 |
| 4406 | 148.43 |
| 4407 | 149.43 |
| 4408 | 150.43 |
| 4409 | 151.43 |
| 4410 | 152.43 |
| 4411 | 153.43 |
| 4412 | 154.43 |
| 4413 | 155.43 |
| 4414 | 156.43 |
| 4415 | 157.43 |
| 4416 | 158.43 |
| 4417 | 159.43 |
| 4418 | 160.43 |
| 4419 | 161.43 |
| 4420 | 162.43 |
| 4421 | 163.43 |
| 4422 | 164.43 |
| 4423 | 165.43 |
| 4424 | 166.43 |
| 4425 | 167.43 |
| 4426 | 168.43 |
| 4427 | 169.43 |
| 4428 | 170.43 |
| 4429 | 171.43 |
| 4430 | 172.43 |
| 4431 | 173.475 |
| 4432 | 174.52 |
| 4433 | 175.565 |
| 4434 | 163.61 |
| 4435 | 156.843 |
| 4436 | 157.877 |
| 4437 | 158.91 |
| 4438 | 159.91 |
| 4439 | 160.91 |
| 4440 | 161.973 |
| 4441 | 150.537 |
| 4442 | 151.6 |
| 4443 | 152.6 |
| 4444 | 153.6 |
| 4445 | 147.85 |
| 4446 | 148.9 |
| 4447 | 142.12 |
| 4448 | 143.14 |
| 4449 | 144.16 |
| 4450 | 145.18 |
| 4451 | 146.18 |
| 4452 | 147.18 |
| 4453 | 148.18 |
| 4454 | 149.18 |
| 4455 | 150.18 |
| 4456 | 151.18 |
| 4457 | 152.18 |
| 4458 | 153.18 |
| 4459 | 154.18 |
| 4460 | 155.18 |
| 4461 | 156.18 |
| 4462 | 157.18 |
| 4463 | 158.18 |
| 4464 | 159.18 |
| 4465 | 160.18 |
| 4466 | 161.18 |
| 4467 | 162.18 |
| 4468 | 163.18 |
| 4469 | 164.18 |
| 4470 | 165.18 |
| 4471 | 166.18 |
| 4472 | 167.18 |
| 4473 | 168.18 |
| 4474 | 169.18 |
| 4475 | 170.18 |
| 4476 | 171.18 |
| 4477 | 172.18 |
| 4478 | 173.18 |
| 4479 | 174.18 |
| 4480 | 175.18 |
| 4481 | 176.18 |
| 4482 | 177.18 |
| 4483 | 171.007 |
| 4484 | 172.033 |
| 4485 | 173.06 |
| 4486 | 170.625 |
| 4487 | 171.64 |
| 4488 | 172.64 |
| 4489 | 173.64 |
| 4490 | 174.64 |
| 4491 | 175.64 |
| 4492 | 176.662 |
| 4493 | 169.085 |
| 4494 | 170.107 |
| 4495 | 171.13 |
| 4496 | 172.13 |
| 4497 | 173.13 |
| 4498 | 174.13 |
| 4499 | 175.13 |
| 4500 | 176.13 |
| 4501 | 177.13 |
| 4502 | 178.13 |
| 4503 | 179.21 |
| 4504 | 180.29 |
| 4505 | 181.37 |
| 4506 | 162.45 |
| 4507 | 163.45 |
| 4508 | 164.45 |
| 4509 | 165.45 |
| 4510 | 166.45 |
| 4511 | 167.45 |
| 4512 | 168.45 |
| 4513 | 169.45 |
| 4514 | 170.45 |
| 4515 | 171.45 |
| 4516 | 172.45 |
| 4517 | 173.45 |
| 4518 | 174.45 |
| 4519 | 175.45 |
| 4520 | 176.45 |
| 4521 | 177.45 |
| 4522 | 178.45 |
| 4523 | 179.45 |
| 4524 | 180.45 |
| 4525 | 181.45 |
| 4526 | 178.257 |
| 4527 | 179.263 |
| 4528 | 180.27 |
| 4529 | 181.41 |
| 4530 | 182.55 |
| 4531 | 159.69 |
| 4532 | 160.69 |
| 4533 | 161.69 |
| 4534 | 162.69 |
| 4535 | 163.69 |
| 4536 | 164.69 |
| 4537 | 165.69 |
| 4538 | 166.69 |
| 4539 | 167.69 |
| 4540 | 168.69 |
| 4541 | 169.69 |
| 4542 | 170.69 |
| 4543 | 171.69 |
| 4544 | 172.69 |
| 4545 | 173.69 |
| 4546 | 174.69 |
| 4547 | 175.69 |
| 4548 | 176.69 |
| 4549 | 177.69 |
| 4550 | 178.69 |
| 4551 | 179.69 |
| 4552 | 180.715 |
| 4553 | 172.94 |
| 4554 | 173.965 |
| 4555 | 174.99 |
| 4556 | 171.7 |
| 4557 | 172.71 |
| 4558 | 173.72 |
| 4559 | 166.553 |
| 4560 | 167.587 |
| 4561 | 168.62 |
| 4562 | 169.62 |
| 4563 | 170.62 |
| 4564 | 171.62 |
| 4565 | 172.62 |
| 4566 | 173.62 |
| 4567 | 174.62 |
| 4568 | 175.62 |
| 4569 | 170.032 |
| 4570 | 171.045 |
| 4571 | 172.057 |
| 4572 | 173.07 |
| 4573 | 174.07 |
| 4574 | 175.07 |
| 4575 | 176.07 |
| 4576 | 177.07 |
| 4577 | 178.07 |
| 4578 | 179.07 |
| 4579 | 180.07 |
| 4580 | 181.07 |
| 4581 | 182.07 |
| 4582 | 183.095 |
| 4583 | 175.32 |
| 4584 | 176.345 |
| 4585 | 177.37 |
| 4586 | 178.37 |
| 4587 | 179.37 |
| 4588 | 180.37 |
| 4589 | 181.37 |
| 4590 | 182.37 |
| 4591 | 183.37 |
| 4592 | 184.37 |
| 4593 | 185.37 |
| 4594 | 186.37 |
| 4595 | 187.37 |
| 4596 | 188.37 |
| 4597 | 189.37 |
| 4598 | 190.37 |
| 4599 | 191.37 |
| 4600 | 192.37 |
| 4601 | 193.37 |
| 4602 | 194.37 |
| 4603 | 188.585 |
| 4604 | 189.6 |
| 4605 | 190.615 |
| 4606 | 191.63 |
| 4607 | 184.067 |
| 4608 | 185.103 |
| 4609 | 186.14 |
| 4610 | 187.14 |
| 4611 | 188.14 |
| 4612 | 189.14 |
| 4613 | 190.14 |
| 4614 | 191.14 |
| 4615 | 192.14 |
| 4616 | 193.14 |
| 4617 | 194.14 |
| 4618 | 195.14 |
| 4619 | 196.14 |
| 4620 | 197.14 |
| 4621 | 198.14 |
| 4622 | 199.14 |
| 4623 | 200.14 |
| 4624 | 201.14 |
| 4625 | 202.14 |
| 4626 | 199.06 |
| 4627 | 200.08 |
| 4628 | 201.08 |
| 4629 | 202.08 |
| 4630 | 198.65 |
| 4631 | 199.65 |
| 4632 | 200.65 |
| 4633 | 201.65 |
| 4634 | 202.65 |
| 4635 | 198.83 |
| 4636 | 199.83 |
| 4637 | 200.83 |
| 4638 | 201.83 |
| 4639 | 202.83 |
| 4640 | 199.3 |
| 4641 | 200.3 |
| 4642 | 197.8 |
| 4643 | 198.8 |
| 4644 | 196.06 |
| 4645 | 193.28 |
| 4646 | 194.3 |
| 4647 | 195.3 |
| 4648 | 192.36 |
| 4649 | 189.57 |
| 4650 | 186.97 |
| 4651 | 183.99 |
| 4652 | 185.01 |
| 4653 | 186.01 |
| 4654 | 187.01 |
| 4655 | 188.01 |
| 4656 | 189.01 |
| 4657 | 190.01 |
| 4658 | 191.01 |
| 4659 | 192.01 |
| 4660 | 193.01 |
| 4661 | 194.01 |
| 4662 | 195.01 |
| 4663 | 196.01 |
| 4664 | 192.635 |
| 4665 | 193.66 |
| 4666 | 194.66 |
| 4667 | 195.66 |
| 4668 | 196.66 |
| 4669 | 197.66 |
| 4670 | 198.66 |
| 4671 | 199.66 |
| 4672 | 196.03 |
| 4673 | 197.03 |
| 4674 | 198.03 |
| 4675 | 199.03 |
| 4676 | 200.03 |
| 4677 | 201.03 |
| 4678 | 202.03 |
| 4679 | 203.03 |
| 4680 | 204.03 |
| 4681 | 205.03 |
| 4682 | 206.03 |
| 4683 | 207.03 |
| 4684 | 203.89 |
| 4685 | 204.91 |
| 4686 | 201.93 |
| 4687 | 202.93 |
| 4688 | 203.93 |
| 4689 | 200.11 |
| 4690 | 201.11 |
| 4691 | 202.11 |
| 4692 | 203.11 |
| 4693 | 204.11 |
| 4694 | 205.11 |
| 4695 | 206.11 |
| 4696 | 207.11 |
| 4697 | 208.11 |
| 4698 | 209.11 |
| 4699 | 210.11 |
| 4700 | 211.11 |
| 4701 | 212.11 |
| 4702 | 213.11 |
| 4703 | 214.11 |
| 4704 | 215.11 |
| 4705 | 212.525 |
| 4706 | 213.54 |
| 4707 | 214.54 |
| 4708 | 210.52 |
| 4709 | 206.7 |
| 4710 | 207.7 |
| 4711 | 205.015 |
| 4712 | 206.03 |
| 4713 | 207.055 |
| 4714 | 203.78 |
| 4715 | 204.78 |
| 4716 | 202.295 |
| 4717 | 203.31 |
| 4718 | 204.31 |
| 4719 | 205.335 |
| 4720 | 202.06 |
| 4721 | 203.06 |
| 4722 | 204.06 |
| 4723 | 205.06 |
| 4724 | 206.06 |
| 4725 | 207.06 |
| 4726 | 208.06 |
| 4727 | 209.06 |
| 4728 | 210.06 |
| 4729 | 206.73 |
| 4730 | 207.73 |
| 4731 | 208.73 |
| 4732 | 209.73 |
| 4733 | 210.73 |
| 4734 | 211.73 |
| 4735 | 212.73 |
| 4736 | 213.73 |
| 4737 | 214.73 |
| 4738 | 215.73 |
| 4739 | 216.73 |
| 4740 | 211.05 |
| 4741 | 212.05 |
| 4742 | 213.05 |
| 4743 | 214.05 |
| 4744 | 210.52 |
| 4745 | 211.52 |
| 4746 | 212.52 |
| 4747 | 209.83 |
| 4748 | 210.83 |
| 4749 | 208.33 |
| 4750 | 209.33 |
| 4751 | 204.72 |
| 4752 | 205.72 |
| 4753 | 206.72 |
| 4754 | 207.72 |
| 4755 | 204.68 |
| 4756 | 205.68 |
| 4757 | 206.68 |
| 4758 | 207.68 |
| 4759 | 208.68 |
| 4760 | 209.68 |
| 4761 | 210.68 |
| 4762 | 211.68 |
| 4763 | 209.045 |
| 4764 | 210.06 |
| 4765 | 211.06 |
| 4766 | 212.06 |
| 4767 | 213.06 |
| 4768 | 214.06 |
| 4769 | 215.06 |
| 4770 | 216.06 |
| 4771 | 217.06 |
| 4772 | 218.06 |
| 4773 | 219.08 |
| 4774 | 216.25 |
| 4775 | 217.25 |
| 4776 | 218.25 |
| 4777 | 219.25 |
| 4778 | 220.25 |
| 4779 | 221.25 |
| 4780 | 222.25 |
| 4781 | 223.25 |
| 4782 | 224.25 |
| 4783 | 225.25 |
| 4784 | 226.25 |
| 4785 | 227.25 |
| 4786 | 228.25 |
| 4787 | 229.25 |
| 4788 | 230.25 |
| 4789 | 231.25 |
| 4790 | 228.17 |
| 4791 | 229.19 |
| 4792 | 230.205 |
| 4793 | 227.52 |
| 4794 | 223.6 |
| 4795 | 224.6 |
| 4796 | 221.71 |
| 4797 | 222.71 |
| 4798 | 223.71 |
| 4799 | 224.71 |
| 4800 | 225.71 |
| 4801 | 226.71 |
| 4802 | 223.38 |
| 4803 | 224.38 |
| 4804 | 225.38 |
| 4805 | 222.895 |
| 4806 | 223.91 |
| 4807 | 224.91 |
| 4808 | 225.91 |
| 4809 | 226.91 |
| 4810 | 227.91 |
| 4811 | 228.91 |
| 4812 | 229.91 |
| 4813 | 224.42 |
| 4814 | 225.42 |
| 4815 | 226.42 |
| 4816 | 227.42 |
| 4817 | 228.42 |
| 4818 | 225.82 |
| 4819 | 226.82 |
| 4820 | 227.82 |
| 4821 | 225.04 |
| 4822 | 226.06 |
| 4823 | 222.73 |
| 4824 | 223.73 |
| 4825 | 220.84 |
| 4826 | 221.84 |
| 4827 | 222.84 |
| 4828 | 223.84 |
| 4829 | 224.84 |
| 4830 | 225.84 |
| 4831 | 222.02 |
| 4832 | 223.02 |
| 4833 | 218.85 |
| 4834 | 219.88 |
| 4835 | 216.25 |
| 4836 | 211.74 |
| 4837 | 212.74 |
| 4838 | 213.74 |
| 4839 | 209.33 |
| 4840 | 206.39 |
| 4841 | 207.39 |
| 4842 | 204.89 |
| 4843 | 205.89 |
| 4844 | 206.89 |
| 4845 | 207.89 |
| 4846 | 208.89 |
| 4847 | 205.215 |
| 4848 | 206.24 |
| 4849 | 203.5 |
| 4850 | 204.5 |
| 4851 | 205.52 |
| 4852 | 202.69 |
| 4853 | 199.415 |
| 4854 | 200.44 |
| 4855 | 201.44 |
| 4856 | 202.44 |
| 4857 | 199.56 |
| 4858 | 200.58 |
| 4859 | 201.58 |
| 4860 | 202.58 |
| 4861 | 203.58 |
| 4862 | 204.58 |
| 4863 | 205.58 |
| 4864 | 206.58 |
| 4865 | 207.58 |
| 4866 | 208.58 |
| 4867 | 209.58 |
| 4868 | 210.58 |
| 4869 | 211.58 |
| 4870 | 212.58 |
| 4871 | 213.58 |
| 4872 | 214.58 |
| 4873 | 215.58 |
| 4874 | 216.58 |
| 4875 | 217.58 |
| 4876 | 218.58 |
| 4877 | 219.58 |
| 4878 | 220.58 |
| 4879 | 221.58 |
| 4880 | 222.58 |
| 4881 | 219.44 |
| 4882 | 220.44 |
| 4883 | 221.44 |
| 4884 | 222.44 |
| 4885 | 223.44 |
| 4886 | 224.47 |
| 4887 | 220.7 |
| 4888 | 217.66 |
| 4889 | 218.66 |
| 4890 | 219.66 |
| 4891 | 220.66 |
| 4892 | 221.66 |
| 4893 | 222.66 |
| 4894 | 223.66 |
| 4895 | 224.66 |
| 4896 | 225.66 |
| 4897 | 226.685 |
| 4898 | 223.11 |
| 4899 | 224.11 |
| 4900 | 225.11 |
| 4901 | 226.11 |
| 4902 | 227.11 |
| 4903 | 228.11 |
| 4904 | 229.13 |
| 4905 | 226.3 |
| 4906 | 227.3 |
| 4907 | 228.32 |
| 4908 | 225.44 |
| 4909 | 226.46 |
| 4910 | 223.28 |
| 4911 | 224.28 |
| 4912 | 220.65 |
| 4913 | 221.65 |
| 4914 | 222.65 |
| 4915 | 220.1 |
| 4916 | 221.1 |
| 4917 | 222.1 |
| 4918 | 223.1 |
| 4919 | 224.1 |
| 4920 | 225.1 |
| 4921 | 226.1 |
| 4922 | 227.1 |
| 4923 | 228.1 |
| 4924 | 229.1 |
| 4925 | 225.87 |
| 4926 | 226.87 |
| 4927 | 227.87 |
| 4928 | 228.895 |
| 4929 | 225.42 |
| 4930 | 226.42 |
| 4931 | 227.42 |
| 4932 | 228.42 |
| 4933 | 229.42 |
| 4934 | 230.42 |
| 4935 | 231.42 |
| 4936 | 232.42 |
| 4937 | 233.42 |
| 4938 | 234.42 |
| 4939 | 235.42 |
| 4940 | 236.42 |
| 4941 | 232.5 |
| 4942 | 233.5 |
| 4943 | 234.5 |
| 4944 | 232 |
| 4945 | 233 |
| 4946 | 234 |
| 4947 | 235 |
| 4948 | 232.415 |
| 4949 | 233.43 |
| 4950 | 234.43 |
| 4951 | 235.43 |
| 4952 | 232.74 |
| 4953 | 233.74 |
| 4954 | 234.74 |
| 4955 | 235.74 |
| 4956 | 232.51 |
| 4957 | 233.51 |
| 4958 | 234.545 |
| 4959 | 229.88 |
| 4960 | 227.23 |
| 4961 | 224.45 |
| 4962 | 225.47 |
| 4963 | 222.24 |
| 4964 | 223.24 |
| 4965 | 224.24 |
| 4966 | 225.24 |
| 4967 | 226.24 |
| 4968 | 227.24 |
| 4969 | 228.24 |
| 4970 | 229.24 |
| 4971 | 230.24 |
| 4972 | 231.24 |
| 4973 | 232.24 |
| 4974 | 233.24 |
| 4975 | 234.24 |
| 4976 | 235.24 |
| 4977 | 231.71 |
| 4978 | 229.02 |
| 4979 | 230.02 |
| 4980 | 231.02 |
| 4981 | 232.045 |
| 4982 | 228.57 |
| 4983 | 229.59 |
| 4984 | 226.86 |
| 4985 | 227.86 |
| 4986 | 228.86 |
| 4987 | 229.86 |
| 4988 | 230.86 |
| 4989 | 231.86 |
| 4990 | 232.86 |
| 4991 | 233.86 |
| 4992 | 234.86 |
| 4993 | 235.86 |
| 4994 | 236.86 |
| 4995 | 237.86 |
| 4996 | 238.86 |
| 4997 | 239.86 |
| 4998 | 240.86 |
| 4999 | 241.86 |
| 5000 | 242.86 |
| 5001 | 243.86 |
| 5002 | 244.86 |
| 5003 | 245.86 |
| 5004 | 246.86 |
| 5005 | 247.86 |
| 5006 | 245.12 |
| 5007 | 246.12 |
| 5008 | 247.12 |
| 5009 | 248.12 |
| 5010 | 249.12 |
| 5011 | 245.69 |
| 5012 | 246.69 |
| 5013 | 247.69 |
| 5014 | 248.69 |
| 5015 | 249.69 |
| 5016 | 250.69 |
| 5017 | 251.69 |
| 5018 | 252.69 |
| 5019 | 253.69 |
| 5020 | 254.69 |
| 5021 | 251.55 |
| 5022 | 247.83 |
| 5023 | 248.83 |
| 5024 | 249.83 |
| 5025 | 246.5 |
| 5026 | 243.36 |
| 5027 | 244.36 |
| 5028 | 245.36 |
| 5029 | 246.36 |
| 5030 | 247.36 |
| 5031 | 248.36 |
| 5032 | 249.36 |
| 5033 | 245.54 |
| 5034 | 246.54 |
| 5035 | 247.54 |
| 5036 | 244.6 |
| 5037 | 245.6 |
| 5038 | 246.6 |
| 5039 | 247.6 |
| 5040 | 248.6 |
| 5041 | 249.6 |
| 5042 | 250.6 |
| 5043 | 251.6 |
| 5044 | 252.6 |
| 5045 | 253.6 |
| 5046 | 250.81 |
| 5047 | 251.81 |
| 5048 | 247.79 |
| 5049 | 245 |
| 5050 | 246 |
| 5051 | 242.77 |
| 5052 | 243.77 |
| 5053 | 244.77 |
| 5054 | 245.77 |
| 5055 | 242.14 |
| 5056 | 243.14 |
| 5057 | 244.14 |
| 5058 | 241.35 |
| 5059 | 242.35 |
| 5060 | 243.35 |
| 5061 | 238.65 |
| 5062 | 239.65 |
| 5063 | 240.65 |
| 5064 | 241.65 |
| 5065 | 242.65 |
| 5066 | 243.65 |
| 5067 | 238.75 |
| 5068 | 239.75 |
| 5069 | 240.75 |
| 5070 | 241.75 |
| 5071 | 238.42 |
| 5072 | 239.42 |
| 5073 | 240.42 |
| 5074 | 237.38 |
| 5075 | 238.38 |
| 5076 | 234.85 |
| 5077 | 235.85 |
| 5078 | 236.85 |
| 5079 | 237.85 |
| 5080 | 234.03 |
| 5081 | 235.03 |
| 5082 | 236.03 |
| 5083 | 231.72 |
| 5084 | 232.72 |
| 5085 | 229.88 |
| 5086 | 230.88 |
| 5087 | 231.88 |
| 5088 | 232.88 |
| 5089 | 233.88 |
| 5090 | 230.94 |
| 5091 | 231.94 |
| 5092 | 232.94 |
| 5093 | 233.94 |
| 5094 | 234.94 |
| 5095 | 235.94 |
| 5096 | 236.94 |
| 5097 | 237.94 |
| 5098 | 238.94 |
| 5099 | 239.94 |
| 5100 | 240.94 |
| 5101 | 241.94 |
| 5102 | 242.94 |
| 5103 | 240 |
| 5104 | 241 |
| 5105 | 242 |
| 5106 | 243 |
| 5107 | 239.37 |
| 5108 | 240.37 |
| 5109 | 241.37 |
| 5110 | 242.37 |
| 5111 | 243.37 |
| 5112 | 244.37 |
| 5113 | 245.37 |
| 5114 | 246.37 |
| 5115 | 247.37 |
| 5116 | 248.37 |
| 5117 | 249.37 |
| 5118 | 250.37 |
| 5119 | 251.37 |
| 5120 | 252.37 |
| 5121 | 253.37 |
| 5122 | 254.37 |
| 5123 | 255.37 |
| 5124 | 252.14 |
| 5125 | 253.14 |
| 5126 | 254.14 |
| 5127 | 255.14 |
| 5128 | 256.14 |
| 5129 | 252.71 |
| 5130 | 249.18 |
| 5131 | 250.18 |
| 5132 | 251.18 |
| 5133 | 252.18 |
| 5134 | 253.18 |
| 5135 | 254.18 |
| 5136 | 251.14 |
| 5137 | 252.14 |
| 5138 | 253.14 |
| 5139 | 254.14 |
| 5140 | 255.14 |
| 5141 | 251.32 |
| 5142 | 252.32 |
| 5143 | 253.32 |
| 5144 | 254.32 |
| 5145 | 251.63 |
| 5146 | 252.63 |
| 5147 | 253.63 |
| 5148 | 254.63 |
| 5149 | 249.73 |
| 5150 | 250.73 |
| 5151 | 251.73 |
| 5152 | 252.73 |
| 5153 | 253.73 |
| 5154 | 254.73 |
| 5155 | 250.52 |
| 5156 | 251.52 |
| 5157 | 248.48 |
| 5158 | 249.48 |
| 5159 | 250.48 |
| 5160 | 251.48 |
| 5161 | 252.48 |
| 5162 | 253.48 |
| 5163 | 254.48 |
| 5164 | 255.48 |
| 5165 | 256.48 |
| 5166 | 253.25 |
| 5167 | 254.25 |
| 5168 | 251.41 |
| 5169 | 252.41 |
| 5170 | 253.41 |
| 5171 | 250.72 |
| 5172 | 251.72 |
| 5173 | 248.93 |
| 5174 | 249.93 |
| 5175 | 250.93 |
| 5176 | 251.93 |
| 5177 | 252.93 |
| 5178 | 253.93 |
| 5179 | 254.93 |
| 5180 | 255.93 |
| 5181 | 256.93 |
| 5182 | 257.93 |
| 5183 | 258.93 |
| 5184 | 255.99 |
| 5185 | 256.99 |
| 5186 | 252.97 |
| 5187 | 253.97 |
| 5188 | 254.97 |
| 5189 | 255.97 |
| 5190 | 256.97 |
| 5191 | 257.97 |
| 5192 | 258.97 |
| 5193 | 259.97 |
| 5194 | 260.97 |
| 5195 | 257.44 |
| 5196 | 258.44 |
| 5197 | 259.44 |
| 5198 | 255.32 |
| 5199 | 252.63 |
| 5200 | 253.63 |
| 5201 | 254.63 |
| 5202 | 255.63 |
| 5203 | 256.63 |
| 5204 | 253.74 |
| 5205 | 254.74 |
| 5206 | 255.74 |
| 5207 | 256.74 |
| 5208 | 257.74 |
| 5209 | 258.74 |
| 5210 | 255.6 |
| 5211 | 252.37 |
| 5212 | 253.37 |
| 5213 | 254.37 |
| 5214 | 255.37 |
| 5215 | 256.37 |
| 5216 | 257.37 |
| 5217 | 258.37 |
| 5218 | 259.37 |
| 5219 | 260.37 |
| 5220 | 261.37 |
| 5221 | 262.37 |
| 5222 | 263.37 |
| 5223 | 260.43 |
| 5224 | 261.43 |
| 5225 | 262.43 |
| 5226 | 263.43 |
| 5227 | 264.43 |
| 5228 | 265.43 |
| 5229 | 266.43 |
| 5230 | 267.43 |
| 5231 | 268.43 |
| 5232 | 269.43 |
| 5233 | 266.64 |
| 5234 | 267.64 |
| 5235 | 268.64 |
| 5236 | 269.64 |
| 5237 | 266.95 |
| 5238 | 267.95 |
| 5239 | 268.95 |
| 5240 | 269.95 |
| 5241 | 270.95 |
| 5242 | 271.95 |
| 5243 | 272.95 |
| 5244 | 273.95 |
| 5245 | 274.95 |
| 5246 | 275.95 |
| 5247 | 276.95 |
| 5248 | 277.95 |
| 5249 | 278.95 |
| 5250 | 273.27 |
| 5251 | 274.27 |
| 5252 | 275.27 |
| 5253 | 276.27 |
| 5254 | 277.27 |
| 5255 | 278.27 |
| 5256 | 274.15 |
| 5257 | 275.15 |
| 5258 | 276.15 |
| 5259 | 277.15 |
| 5260 | 273.72 |
| 5261 | 274.72 |
| 5262 | 275.72 |
| 5263 | 276.72 |
| 5264 | 277.72 |
| 5265 | 278.72 |
| 5266 | 279.72 |
| 5267 | 280.72 |
| 5268 | 281.72 |
| 5269 | 282.72 |
| 5270 | 283.72 |
| 5271 | 284.72 |
| 5272 | 281.49 |
| 5273 | 282.49 |
| 5274 | 283.49 |
| 5275 | 284.49 |
| 5276 | 285.49 |
| 5277 | 286.49 |
| 5278 | 287.49 |
| 5279 | 288.49 |
| 5280 | 289.49 |
| 5281 | 290.49 |
| 5282 | 291.49 |
| 5283 | 292.49 |
| 5284 | 288.08 |
| 5285 | 289.08 |
| 5286 | 290.08 |
| 5287 | 291.08 |
| 5288 | 292.08 |
| 5289 | 289.14 |
| 5290 | 285.42 |
| 5291 | 286.42 |
| 5292 | 287.42 |
| 5293 | 288.42 |
| 5294 | 284.89 |
| 5295 | 285.89 |
| 5296 | 286.89 |
| 5297 | 287.89 |
| 5298 | 288.89 |
| 5299 | 289.89 |
| 5300 | 290.89 |
| 5301 | 291.89 |
| 5302 | 288.56 |
| 5303 | 285.03 |
| 5304 | 286.03 |
| 5305 | 287.03 |
| 5306 | 283.31 |
| 5307 | 284.31 |
| 5308 | 285.31 |
| 5309 | 286.31 |
| 5310 | 287.31 |
| 5311 | 284.08 |
| 5312 | 281.29 |
| 5313 | 282.29 |
| 5314 | 283.29 |
| 5315 | 284.29 |
| 5316 | 285.29 |
| 5317 | 286.29 |
| 5318 | 287.29 |
| 5319 | 288.29 |
| 5320 | 289.29 |
| 5321 | 290.29 |
| 5322 | 287.4 |
| 5323 | 288.4 |
| 5324 | 289.4 |
| 5325 | 286.36 |
| 5326 | 287.36 |
| 5327 | 288.36 |
| 5328 | 289.36 |
| 5329 | 290.36 |
| 5330 | 291.36 |
| 5331 | 292.36 |
| 5332 | 293.36 |
| 5333 | 289.83 |
| 5334 | 286.94 |
| 5335 | 287.94 |
| 5336 | 288.94 |
| 5337 | 289.94 |
| 5338 | 290.94 |
| 5339 | 291.94 |
| 5340 | 288.8 |
| 5341 | 289.8 |
| 5342 | 290.8 |
| 5343 | 291.8 |
| 5344 | 292.8 |
| 5345 | 293.8 |
| 5346 | 294.8 |
| 5347 | 290.39 |
| 5348 | 291.39 |
| 5349 | 292.39 |
| 5350 | 289.5 |
| 5351 | 285.38 |
| 5352 | 282.64 |
| 5353 | 283.64 |
| 5354 | 284.64 |
| 5355 | 285.64 |
| 5356 | 286.64 |
| 5357 | 287.64 |
| 5358 | 288.64 |
| 5359 | 289.64 |
| 5360 | 290.64 |
| 5361 | 291.64 |
| 5362 | 292.64 |
| 5363 | 293.64 |
| 5364 | 294.64 |
| 5365 | 291.7 |
| 5366 | 292.7 |
| 5367 | 293.7 |
| 5368 | 294.7 |
| 5369 | 290.88 |
| 5370 | 291.88 |
| 5371 | 288.74 |
| 5372 | 289.74 |
| 5373 | 290.74 |
| 5374 | 291.74 |
| 5375 | 292.74 |
| 5376 | 293.74 |
| 5377 | 294.74 |
| 5378 | 291.95 |
| 5379 | 292.95 |
| 5380 | 293.95 |
| 5381 | 294.95 |
| 5382 | 295.95 |
| 5383 | 296.95 |
| 5384 | 293.13 |
| 5385 | 290.09 |
| 5386 | 291.09 |
| 5387 | 292.09 |
| 5388 | 288.86 |
| 5389 | 289.86 |
| 5390 | 290.86 |
| 5391 | 288.17 |
| 5392 | 289.17 |
| 5393 | 290.17 |
| 5394 | 291.17 |
| 5395 | 292.17 |
| 5396 | 293.17 |
| 5397 | 294.17 |
| 5398 | 295.17 |
| 5399 | 296.17 |
| 5400 | 297.17 |
| 5401 | 298.17 |
| 5402 | 294.74 |
| 5403 | 295.74 |
| 5404 | 296.74 |
| 5405 | 293.85 |
| 5406 | 294.85 |
| 5407 | 295.85 |
| 5408 | 292.91 |
| 5409 | 293.91 |
| 5410 | 294.91 |
| 5411 | 295.91 |
| 5412 | 296.91 |
| 5413 | 297.91 |
| 5414 | 298.91 |
| 5415 | 299.91 |
| 5416 | 300.91 |
| 5417 | 301.91 |
| 5418 | 302.91 |
| 5419 | 303.91 |
| 5420 | 301.02 |
| 5421 | 302.02 |
| 5422 | 297.32 |
| 5423 | 298.32 |
| 5424 | 299.32 |
| 5425 | 300.32 |
| 5426 | 296.6 |
| 5427 | 297.6 |
| 5428 | 298.6 |
| 5429 | 295.07 |
| 5430 | 296.07 |
| 5431 | 297.07 |
| 5432 | 298.07 |
| 5433 | 295.03 |
| 5434 | 292.09 |
| 5435 | 293.09 |
| 5436 | 289.66 |
| 5437 | 290.66 |
| 5438 | 287.43 |
| 5439 | 284.74 |
| 5440 | 285.74 |
| 5441 | 286.74 |
| 5442 | 283.11 |
| 5443 | 280.27 |
| 5444 | 281.27 |
| 5445 | 282.27 |
| 5446 | 283.27 |
| 5447 | 284.27 |
| 5448 | 281.43 |
| 5449 | 277.41 |
| 5450 | 278.41 |
| 5451 | 279.41 |
| 5452 | 280.41 |
| 5453 | 281.41 |
| 5454 | 282.41 |
| 5455 | 283.41 |
| 5456 | 284.41 |
| 5457 | 280.69 |
| 5458 | 281.69 |
| 5459 | 282.69 |
| 5460 | 283.69 |
| 5461 | 279.97 |
| 5462 | 280.97 |
| 5463 | 281.97 |
| 5464 | 282.97 |
| 5465 | 280.28 |
| 5466 | 281.28 |
| 5467 | 282.28 |
| 5468 | 283.28 |
| 5469 | 284.28 |
| 5470 | 285.28 |
| 5471 | 286.28 |
| 5472 | 287.28 |
| 5473 | 283.65 |
| 5474 | 284.65 |
| 5475 | 285.65 |
| 5476 | 282.71 |
| 5477 | 283.71 |
| 5478 | 284.71 |
| 5479 | 285.71 |
| 5480 | 286.71 |
| 5481 | 287.71 |
| 5482 | 288.71 |
| 5483 | 289.71 |
| 5484 | 290.71 |
| 5485 | 291.71 |
| 5486 | 287.59 |
| 5487 | 288.59 |
| 5488 | 289.59 |
| 5489 | 290.59 |
| 5490 | 287.55 |
| 5491 | 288.55 |
| 5492 | 284.24 |
| 5493 | 285.24 |
| 5494 | 286.24 |
| 5495 | 283.2 |
| 5496 | 284.2 |
| 5497 | 285.2 |
| 5498 | 286.2 |
| 5499 | 287.2 |
| 5500 | 288.2 |
| 5501 | 289.2 |
| 5502 | 290.2 |
| 5503 | 291.2 |
| 5504 | 292.2 |
| 5505 | 293.2 |
| 5506 | 294.2 |
| 5507 | 290.57 |
| 5508 | 286.26 |
| 5509 | 282.83 |
| 5510 | 283.83 |
| 5511 | 284.83 |
| 5512 | 285.83 |
| 5513 | 286.83 |
| 5514 | 287.83 |
| 5515 | 288.83 |
| 5516 | 289.83 |
| 5517 | 290.83 |
| 5518 | 291.83 |
| 5519 | 292.83 |
| 5520 | 293.83 |
| 5521 | 294.83 |
| 5522 | 295.83 |
| 5523 | 296.83 |
| 5524 | 297.83 |
| 5525 | 298.83 |
| 5526 | 299.83 |
| 5527 | 300.83 |
| 5528 | 301.83 |
| 5529 | 302.83 |
| 5530 | 294.01 |
| 5531 | 295.01 |
| 5532 | 296.01 |
| 5533 | 297.01 |
| 5534 | 298.01 |
| 5535 | 299.01 |
| 5536 | 300.01 |
| 5537 | 301.01 |
| 5538 | 302.01 |
| 5539 | 303.01 |
| 5540 | 298.89 |
| 5541 | 299.89 |
| 5542 | 300.89 |
| 5543 | 301.89 |
| 5544 | 296.79 |
| 5545 | 297.79 |
| 5546 | 298.79 |
| 5547 | 299.79 |
| 5548 | 295.77 |
| 5549 | 296.77 |
| 5550 | 297.77 |
| 5551 | 298.77 |
| 5552 | 299.77 |
| 5553 | 300.77 |
| 5554 | 301.77 |
| 5555 | 302.77 |
| 5556 | 303.77 |
| 5557 | 304.77 |
| 5558 | 305.77 |
| 5559 | 306.77 |
| 5560 | 307.77 |
| 5561 | 303.85 |
| 5562 | 304.85 |
| 5563 | 305.85 |
| 5564 | 306.85 |
| 5565 | 307.85 |
| 5566 | 308.85 |
| 5567 | 309.85 |
| 5568 | 310.85 |
| 5569 | 306.73 |
| 5570 | 302.32 |
| 5571 | 303.32 |
| 5572 | 299.4 |
| 5573 | 300.4 |
| 5574 | 296.38 |
| 5575 | 297.38 |
| 5576 | 293.21 |
| 5577 | 294.24 |
| 5578 | 295.24 |
| 5579 | 296.24 |
| 5580 | 297.24 |
| 5581 | 298.24 |
| 5582 | 294.22 |
| 5583 | 295.22 |
| 5584 | 296.22 |
| 5585 | 297.22 |
| 5586 | 298.22 |
| 5587 | 299.22 |
| 5588 | 300.22 |
| 5589 | 301.22 |
| 5590 | 302.22 |
| 5591 | 303.22 |
| 5592 | 304.22 |
| 5593 | 305.22 |
| 5594 | 306.22 |
| 5595 | 307.22 |
| 5596 | 302.24 |
| 5597 | 303.26 |
| 5598 | 304.28 |
| 5599 | 305.28 |
| 5600 | 306.28 |
| 5601 | 297.36 |
| 5602 | 298.44 |
| 5603 | 299.44 |
| 5604 | 300.44 |
| 5605 | 301.44 |
| 5606 | 302.44 |
| 5607 | 303.44 |
| 5608 | 304.44 |
| 5609 | 305.44 |
| 5610 | 306.44 |
| 5611 | 307.44 |
| 5612 | 308.44 |
| 5613 | 309.44 |
| 5614 | 310.44 |
| 5615 | 311.44 |
| 5616 | 312.44 |
| 5617 | 313.44 |
| 5618 | 314.44 |
| 5619 | 315.44 |
| 5620 | 316.44 |
| 5621 | 317.44 |
| 5622 | 318.44 |
| 5623 | 312.29 |
| 5624 | 313.34 |
| 5625 | 309.075 |
| 5626 | 310.11 |
| 5627 | 311.11 |
| 5628 | 312.11 |
| 5629 | 313.11 |
| 5630 | 314.11 |
| 5631 | 315.11 |
| 5632 | 316.11 |
| 5633 | 308.775 |
| 5634 | 309.84 |
| 5635 | 310.84 |
| 5636 | 311.84 |
| 5637 | 312.84 |
| 5638 | 313.84 |
| 5639 | 314.84 |
| 5640 | 306.315 |
| 5641 | 307.39 |
| 5642 | 308.39 |
| 5643 | 309.39 |
| 5644 | 305.32 |
| 5645 | 306.35 |
| 5646 | 307.35 |
| 5647 | 308.35 |
| 5648 | 309.407 |
| 5649 | 310.463 |
| 5650 | 300.02 |
| 5651 | 301.02 |
| 5652 | 302.02 |
| 5653 | 303.02 |
| 5654 | 304.02 |
| 5655 | 305.1 |
| 5656 | 296.18 |
| 5657 | 297.18 |
| 5658 | 298.18 |
| 5659 | 299.18 |
| 5660 | 300.18 |
| 5661 | 301.18 |
| 5662 | 302.18 |
| 5663 | 303.18 |
| 5664 | 304.248 |
| 5665 | 305.316 |
| 5666 | 306.384 |
| 5667 | 285.452 |
| 5668 | 286.52 |
| 5669 | 287.55 |
| 5670 | 278.58 |
| 5671 | 279.61 |
| 5672 | 280.64 |
| 5673 | 269.74 |
| 5674 | 270.84 |
| 5675 | 271.84 |
| 5676 | 272.84 |
| 5677 | 273.84 |
| 5678 | 274.84 |
| 5679 | 275.84 |
| 5680 | 276.84 |
| 5681 | 277.84 |
| 5682 | 278.84 |
| 5683 | 279.84 |
| 5684 | 280.84 |
| 5685 | 281.84 |
| 5686 | 282.84 |
| 5687 | 283.84 |
| 5688 | 280.25 |
| 5689 | 281.26 |
| 5690 | 282.27 |
| 5691 | 283.27 |
| 5692 | 284.27 |
| 5693 | 285.27 |
| 5694 | 286.27 |
| 5695 | 287.27 |
| 5696 | 288.27 |
| 5697 | 289.27 |
| 5698 | 290.27 |
| 5699 | 291.27 |
| 5700 | 292.27 |
| 5701 | 293.337 |
| 5702 | 294.403 |
| 5703 | 282.47 |
| 5704 | 283.605 |
| 5705 | 269.24 |
| 5706 | 270.24 |
| 5707 | 271.24 |
| 5708 | 272.24 |
| 5709 | 273.24 |
| 5710 | 274.24 |
| 5711 | 275.24 |
| 5712 | 276.24 |
| 5713 | 277.24 |
| 5714 | 278.24 |
| 5715 | 271.1 |
| 5716 | 272.16 |
| 5717 | 273.16 |
| 5718 | 274.16 |
| 5719 | 275.16 |
| 5720 | 276.16 |
| 5721 | 277.16 |
| 5722 | 278.16 |
| 5723 | 279.16 |
| 5724 | 280.16 |
| 5725 | 281.16 |
| 5726 | 277.685 |
| 5727 | 278.71 |
| 5728 | 279.71 |
| 5729 | 280.71 |
| 5730 | 281.71 |
| 5731 | 282.71 |
| 5732 | 283.71 |
| 5733 | 284.71 |
| 5734 | 285.71 |
| 5735 | 286.71 |
| 5736 | 287.71 |
| 5737 | 288.71 |
| 5738 | 289.71 |
| 5739 | 282.347 |
| 5740 | 283.383 |
| 5741 | 284.42 |
| 5742 | 285.42 |
| 5743 | 286.42 |
| 5744 | 287.42 |
| 5745 | 284.227 |
| 5746 | 285.233 |
| 5747 | 286.24 |
| 5748 | 287.24 |
| 5749 | 288.24 |
| 5750 | 289.24 |
| 5751 | 290.24 |
| 5752 | 291.24 |
| 5753 | 292.24 |
| 5754 | 293.24 |
| 5755 | 294.24 |
| 5756 | 295.24 |
| 5757 | 296.24 |
| 5758 | 297.24 |
| 5759 | 298.24 |
| 5760 | 299.24 |
| 5761 | 300.24 |
| 5762 | 301.24 |
| 5763 | 302.24 |
| 5764 | 303.24 |
| 5765 | 304.24 |
| 5766 | 305.35 |
| 5767 | 293.46 |
| 5768 | 294.52 |
| 5769 | 287.78 |
| 5770 | 288.78 |
| 5771 | 289.78 |
| 5772 | 291.127 |
| 5773 | 292.473 |
| 5774 | 238.82 |
| 5775 | 239.82 |
| 5776 | 240.82 |
| 5777 | 241.82 |
| 5778 | 242.82 |
| 5779 | 243.82 |
| 5780 | 244.82 |
| 5781 | 245.82 |
| 5782 | 246.82 |
| 5783 | 247.82 |
| 5784 | 248.82 |
| 5785 | 249.82 |
| 5786 | 250.82 |
| 5787 | 251.82 |
| 5788 | 252.82 |
| 5789 | 253.82 |
| 5790 | 254.82 |
| 5791 | 255.82 |
| 5792 | 256.82 |
| 5793 | 257.82 |
| 5794 | 258.82 |
| 5795 | 259.82 |
| 5796 | 260.82 |
| 5797 | 261.82 |
| 5798 | 262.82 |
| 5799 | 263.82 |
| 5800 | 264.82 |
| 5801 | 265.82 |
| 5802 | 266.82 |
| 5803 | 267.82 |
| 5804 | 268.82 |
| 5805 | 269.82 |
| 5806 | 270.82 |
| 5807 | 271.82 |
| 5808 | 272.82 |
| 5809 | 273.82 |
| 5810 | 274.82 |
| 5811 | 275.82 |
| 5812 | 276.82 |
| 5813 | 277.82 |
| 5814 | 278.82 |
| 5815 | 279.82 |
| 5816 | 280.82 |
| 5817 | 281.82 |
| 5818 | 282.82 |
| 5819 | 283.82 |
| 5820 | 284.82 |
| 5821 | 285.82 |
| 5822 | 286.82 |
| 5823 | 287.82 |
| 5824 | 288.82 |
| 5825 | 289.82 |
| 5826 | 290.82 |
| 5827 | 291.82 |
| 5828 | 292.82 |
| 5829 | 293.82 |
| 5830 | 294.82 |
| 5831 | 295.82 |
| 5832 | 296.82 |
| 5833 | 297.82 |
| 5834 | 298.82 |
| 5835 | 299.82 |
| 5836 | 300.82 |
| 5837 | 301.82 |
| 5838 | 296.63 |
| 5839 | 297.64 |
| 5840 | 298.65 |
| 5841 | 299.66 |
| 5842 | 300.66 |
| 5843 | 301.66 |
| 5844 | 302.66 |
| 5845 | 303.66 |
| 5846 | 304.66 |
| 5847 | 305.66 |
| 5848 | 306.66 |
| 5849 | 307.66 |
| 5850 | 308.66 |
| 5851 | 309.66 |
| 5852 | 310.66 |
| 5853 | 311.66 |
| 5854 | 312.66 |
| 5855 | 313.66 |
| 5856 | 314.66 |
| 5857 | 315.66 |
| 5858 | 316.66 |
| 5859 | 317.66 |
| 5860 | 318.66 |
| 5861 | 319.66 |
| 5862 | 316.085 |
| 5863 | 317.11 |
| 5864 | 318.11 |
| 5865 | 319.11 |
| 5866 | 315.04 |
| 5867 | 316.07 |
| 5868 | 302.695 |
| 5869 | 303.82 |
| 5870 | 304.82 |
| 5871 | 305.82 |
| 5872 | 306.82 |
| 5873 | 307.82 |
| 5874 | 308.82 |
| 5875 | 309.82 |
| 5876 | 310.82 |
| 5877 | 311.82 |
| 5878 | 312.82 |
| 5879 | 313.82 |
| 5880 | 314.82 |
| 5881 | 315.82 |
| 5882 | 316.82 |
| 5883 | 317.82 |
| 5884 | 318.82 |
| 5885 | 319.82 |
| 5886 | 320.82 |
| 5887 | 321.82 |
| 5888 | 322.82 |
| 5889 | 323.82 |
| 5890 | 305.99 |
| 5891 | 307.16 |
| 5892 | 308.16 |
| 5893 | 309.16 |
| 5894 | 300.635 |
| 5895 | 301.71 |
| 5896 | 302.71 |
| 5897 | 303.71 |
| 5898 | 304.71 |
| 5899 | 305.787 |
| 5900 | 292.363 |
| 5901 | 293.44 |
| 5902 | 294.44 |
| 5903 | 295.44 |
| 5904 | 296.44 |
| 5905 | 297.44 |
| 5906 | 298.44 |
| 5907 | 299.44 |
| 5908 | 300.44 |
| 5909 | 301.44 |
| 5910 | 302.44 |
| 5911 | 303.44 |
| 5912 | 304.44 |
| 5913 | 305.44 |
| 5914 | 306.44 |
| 5915 | 307.44 |
| 5916 | 308.44 |
| 5917 | 309.44 |
| 5918 | 310.44 |
| 5919 | 311.44 |
| 5920 | 312.44 |
| 5921 | 313.44 |
| 5922 | 314.48 |
| 5923 | 306.72 |
| 5924 | 307.76 |
| 5925 | 308.827 |
| 5926 | 309.895 |
| 5927 | 293.462 |
| 5928 | 294.53 |
| 5929 | 295.53 |
| 5930 | 296.53 |
| 5931 | 287.61 |
| 5932 | 288.69 |
| 5933 | 289.69 |
| 5934 | 290.69 |
| 5935 | 291.69 |
| 5936 | 286.8 |
| 5937 | 287.81 |
| 5938 | 288.82 |
| 5939 | 289.83 |
| 5940 | 290.83 |
| 5941 | 291.83 |
| 5942 | 292.83 |
| 5943 | 293.83 |
| 5944 | 294.83 |
| 5945 | 295.83 |
| 5946 | 296.83 |
| 5947 | 297.83 |
| 5948 | 298.83 |
| 5949 | 299.83 |
| 5950 | 300.874 |
| 5951 | 301.918 |
| 5952 | 302.962 |
| 5953 | 288.006 |
| 5954 | 289.05 |
| 5955 | 290.05 |
| 5956 | 291.05 |
| 5957 | 292.05 |
| 5958 | 293.05 |
| 5959 | 294.05 |
| 5960 | 295.05 |
| 5961 | 296.05 |
| 5962 | 297.05 |
| 5963 | 298.05 |
| 5964 | 299.05 |
| 5965 | 300.05 |
| 5966 | 301.05 |
| 5967 | 302.05 |
| 5968 | 303.05 |
| 5969 | 304.05 |
| 5970 | 305.05 |
| 5971 | 306.05 |
| 5972 | 307.05 |
| 5973 | 308.05 |
| 5974 | 309.05 |
| 5975 | 310.05 |
| 5976 | 311.05 |
| 5977 | 312.05 |
| 5978 | 305.58 |
| 5979 | 306.58 |
| 5980 | 301.68 |
| 5981 | 302.68 |
| 5982 | 303.68 |
| 5983 | 297.6 |
| 5984 | 298.6 |
| 5985 | 291.54 |
| 5986 | 292.54 |
| 5987 | 293.54 |
| 5988 | 294.54 |
| 5989 | 295.54 |
| 5990 | 296.54 |
| 5991 | 297.54 |
| 5992 | 298.54 |
| 5993 | 299.54 |
| 5994 | 300.54 |
| 5995 | 301.54 |
| 5996 | 302.54 |
| 5997 | 295.88 |
| 5998 | 290.98 |
| 5999 | 291.98 |
| 6000 | 292.98 |
| 6001 | 287.69 |
| 6002 | 288.69 |
| 6003 | 289.69 |
| 6004 | 290.69 |
| 6005 | 291.69 |
| 6006 | 292.69 |
| 6007 | 293.69 |
| 6008 | 294.69 |
| 6009 | 295.69 |
| 6010 | 296.69 |
| 6011 | 297.69 |
| 6012 | 298.69 |
| 6013 | 299.69 |
| 6014 | 300.69 |
| 6015 | 301.69 |
| 6016 | 293.65 |
| 6017 | 294.65 |
| 6018 | 295.65 |
| 6019 | 296.65 |
| 6020 | 297.65 |
| 6021 | 298.65 |
| 6022 | 293.55 |
| 6023 | 286.49 |
| 6024 | 287.49 |
| 6025 | 288.49 |
| 6026 | 283.2 |
| 6027 | 284.2 |
| 6028 | 285.2 |
| 6029 | 286.2 |
| 6030 | 287.2 |
| 6031 | 288.2 |
| 6032 | 289.2 |
| 6033 | 283.71 |
| 6034 | 284.71 |
| 6035 | 285.71 |
| 6036 | 286.71 |
| 6037 | 281.81 |
| 6038 | 282.81 |
| 6039 | 283.81 |
| 6040 | 284.81 |
| 6041 | 285.81 |
| 6042 | 286.81 |
| 6043 | 287.81 |
| 6044 | 288.81 |
| 6045 | 289.81 |
| 6046 | 283.93 |
| 6047 | 284.93 |
| 6048 | 285.93 |
| 6049 | 286.93 |
| 6050 | 287.93 |
| 6051 | 288.93 |
| 6052 | 280.5 |
| 6053 | 281.5 |
| 6054 | 282.5 |
| 6055 | 283.5 |
| 6056 | 284.5 |
| 6057 | 278.23 |
| 6058 | 279.23 |
| 6059 | 280.23 |
| 6060 | 281.23 |
| 6061 | 282.23 |
| 6062 | 283.23 |
| 6063 | 284.23 |
| 6064 | 285.23 |
| 6065 | 286.23 |
| 6066 | 287.23 |
| 6067 | 288.23 |
| 6068 | 289.23 |
| 6069 | 283.94 |
| 6070 | 284.94 |
| 6071 | 285.94 |
| 6072 | 286.94 |
| 6073 | 287.94 |
| 6074 | 288.94 |
| 6075 | 282.28 |
| 6076 | 283.28 |
| 6077 | 284.28 |
| 6078 | 285.28 |
| 6079 | 286.28 |
| 6080 | 287.28 |
| 6081 | 281.99 |
| 6082 | 282.99 |
| 6083 | 283.99 |
| 6084 | 284.99 |
| 6085 | 285.99 |
| 6086 | 286.99 |
| 6087 | 287.99 |
| 6088 | 288.99 |
| 6089 | 289.99 |
| 6090 | 290.99 |
| 6091 | 291.99 |
| 6092 | 286.11 |
| 6093 | 287.11 |
| 6094 | 281.03 |
| 6095 | 282.03 |
| 6096 | 283.03 |
| 6097 | 275.19 |
| 6098 | 276.19 |
| 6099 | 277.19 |
| 6100 | 278.19 |
| 6101 | 279.19 |
| 6102 | 280.19 |
| 6103 | 273.33 |
| 6104 | 274.33 |
| 6105 | 275.33 |
| 6106 | 276.33 |
| 6107 | 271.43 |
| 6108 | 272.43 |
| 6109 | 273.43 |
| 6110 | 274.43 |
| 6111 | 275.43 |
| 6112 | 276.43 |
| 6113 | 277.43 |
| 6114 | 268.61 |
| 6115 | 269.61 |
| 6116 | 270.61 |
| 6117 | 264.93 |
| 6118 | 265.93 |
| 6119 | 266.93 |
| 6120 | 267.93 |
| 6121 | 268.93 |
| 6122 | 269.93 |
| 6123 | 270.93 |
| 6124 | 271.93 |
| 6125 | 272.93 |
| 6126 | 273.93 |
| 6127 | 274.93 |
| 6128 | 275.93 |
| 6129 | 276.93 |
| 6130 | 277.93 |
| 6131 | 278.93 |
| 6132 | 279.93 |
| 6133 | 280.93 |
| 6134 | 281.93 |
| 6135 | 282.93 |
| 6136 | 283.93 |
| 6137 | 284.93 |
| 6138 | 285.93 |